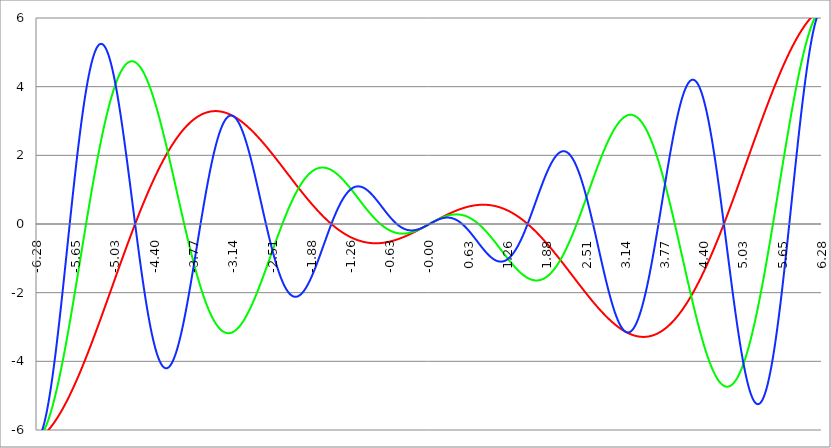
| Category | Series 1 | Series 0 | Series 2 |
|---|---|---|---|
| -6.283185307179586 | -6.283 | -6.283 | -6.283 |
| -6.276902121872407 | -6.277 | -6.276 | -6.276 |
| -6.270618936565228 | -6.27 | -6.269 | -6.266 |
| -6.264335751258049 | -6.263 | -6.26 | -6.254 |
| -6.25805256595087 | -6.256 | -6.25 | -6.24 |
| -6.25176938064369 | -6.249 | -6.239 | -6.224 |
| -6.245486195336511 | -6.241 | -6.228 | -6.206 |
| -6.23920301002933 | -6.233 | -6.215 | -6.185 |
| -6.232919824722153 | -6.225 | -6.201 | -6.162 |
| -6.226636639414973 | -6.217 | -6.187 | -6.137 |
| -6.220353454107794 | -6.208 | -6.171 | -6.11 |
| -6.214070268800615 | -6.199 | -6.155 | -6.081 |
| -6.207787083493435 | -6.19 | -6.137 | -6.05 |
| -6.201503898186257 | -6.181 | -6.119 | -6.016 |
| -6.195220712879077 | -6.171 | -6.1 | -5.981 |
| -6.188937527571898 | -6.161 | -6.079 | -5.943 |
| -6.182654342264719 | -6.151 | -6.058 | -5.904 |
| -6.17637115695754 | -6.141 | -6.036 | -5.862 |
| -6.170087971650361 | -6.131 | -6.013 | -5.818 |
| -6.163804786343182 | -6.12 | -5.989 | -5.773 |
| -6.157521601036002 | -6.109 | -5.964 | -5.725 |
| -6.151238415728823 | -6.098 | -5.938 | -5.676 |
| -6.144955230421644 | -6.086 | -5.912 | -5.624 |
| -6.138672045114464 | -6.075 | -5.884 | -5.571 |
| -6.132388859807286 | -6.063 | -5.856 | -5.516 |
| -6.126105674500106 | -6.051 | -5.826 | -5.458 |
| -6.119822489192927 | -6.038 | -5.796 | -5.399 |
| -6.113539303885748 | -6.026 | -5.765 | -5.339 |
| -6.107256118578569 | -6.013 | -5.733 | -5.276 |
| -6.10097293327139 | -6 | -5.7 | -5.212 |
| -6.09468974796421 | -5.987 | -5.667 | -5.146 |
| -6.088406562657031 | -5.973 | -5.632 | -5.078 |
| -6.082123377349852 | -5.96 | -5.597 | -5.009 |
| -6.075840192042672 | -5.946 | -5.561 | -4.938 |
| -6.069557006735494 | -5.932 | -5.524 | -4.865 |
| -6.063273821428314 | -5.917 | -5.486 | -4.791 |
| -6.056990636121135 | -5.903 | -5.448 | -4.715 |
| -6.050707450813956 | -5.888 | -5.408 | -4.638 |
| -6.044424265506777 | -5.873 | -5.368 | -4.559 |
| -6.038141080199597 | -5.858 | -5.327 | -4.479 |
| -6.031857894892418 | -5.842 | -5.286 | -4.397 |
| -6.025574709585239 | -5.827 | -5.243 | -4.314 |
| -6.01929152427806 | -5.811 | -5.2 | -4.229 |
| -6.013008338970881 | -5.795 | -5.156 | -4.144 |
| -6.006725153663701 | -5.779 | -5.112 | -4.057 |
| -6.000441968356522 | -5.762 | -5.066 | -3.968 |
| -5.994158783049343 | -5.746 | -5.02 | -3.879 |
| -5.987875597742164 | -5.729 | -4.974 | -3.788 |
| -5.981592412434984 | -5.712 | -4.926 | -3.696 |
| -5.975309227127805 | -5.694 | -4.878 | -3.603 |
| -5.969026041820626 | -5.677 | -4.829 | -3.509 |
| -5.962742856513447 | -5.659 | -4.78 | -3.413 |
| -5.956459671206268 | -5.641 | -4.729 | -3.317 |
| -5.950176485899088 | -5.623 | -4.679 | -3.22 |
| -5.94389330059191 | -5.605 | -4.627 | -3.122 |
| -5.93761011528473 | -5.587 | -4.575 | -3.022 |
| -5.931326929977551 | -5.568 | -4.522 | -2.923 |
| -5.925043744670372 | -5.549 | -4.469 | -2.822 |
| -5.918760559363193 | -5.53 | -4.415 | -2.72 |
| -5.912477374056014 | -5.511 | -4.361 | -2.618 |
| -5.906194188748834 | -5.491 | -4.305 | -2.515 |
| -5.899911003441655 | -5.472 | -4.25 | -2.411 |
| -5.893627818134476 | -5.452 | -4.194 | -2.307 |
| -5.887344632827297 | -5.432 | -4.137 | -2.202 |
| -5.881061447520117 | -5.412 | -4.079 | -2.096 |
| -5.874778262212938 | -5.392 | -4.022 | -1.99 |
| -5.868495076905759 | -5.371 | -3.963 | -1.883 |
| -5.86221189159858 | -5.35 | -3.904 | -1.776 |
| -5.855928706291401 | -5.33 | -3.845 | -1.669 |
| -5.849645520984221 | -5.308 | -3.785 | -1.561 |
| -5.843362335677042 | -5.287 | -3.725 | -1.453 |
| -5.837079150369863 | -5.266 | -3.664 | -1.345 |
| -5.830795965062684 | -5.244 | -3.603 | -1.236 |
| -5.824512779755505 | -5.222 | -3.541 | -1.127 |
| -5.818229594448325 | -5.201 | -3.479 | -1.018 |
| -5.811946409141146 | -5.178 | -3.416 | -0.909 |
| -5.805663223833967 | -5.156 | -3.353 | -0.8 |
| -5.799380038526788 | -5.134 | -3.29 | -0.691 |
| -5.793096853219609 | -5.111 | -3.226 | -0.581 |
| -5.78681366791243 | -5.088 | -3.162 | -0.472 |
| -5.780530482605251 | -5.066 | -3.097 | -0.363 |
| -5.774247297298071 | -5.042 | -3.032 | -0.254 |
| -5.767964111990892 | -5.019 | -2.967 | -0.145 |
| -5.761680926683713 | -4.996 | -2.902 | -0.036 |
| -5.755397741376534 | -4.972 | -2.836 | 0.072 |
| -5.749114556069355 | -4.949 | -2.77 | 0.181 |
| -5.742831370762175 | -4.925 | -2.703 | 0.289 |
| -5.736548185454996 | -4.901 | -2.636 | 0.396 |
| -5.730265000147816 | -4.876 | -2.569 | 0.503 |
| -5.723981814840638 | -4.852 | -2.502 | 0.61 |
| -5.717698629533459 | -4.828 | -2.434 | 0.717 |
| -5.711415444226279 | -4.803 | -2.367 | 0.823 |
| -5.7051322589191 | -4.778 | -2.299 | 0.928 |
| -5.698849073611921 | -4.753 | -2.23 | 1.033 |
| -5.692565888304742 | -4.728 | -2.162 | 1.137 |
| -5.686282702997562 | -4.703 | -2.093 | 1.24 |
| -5.679999517690383 | -4.678 | -2.024 | 1.343 |
| -5.673716332383204 | -4.652 | -1.955 | 1.445 |
| -5.667433147076025 | -4.627 | -1.886 | 1.547 |
| -5.661149961768846 | -4.601 | -1.817 | 1.648 |
| -5.654866776461667 | -4.575 | -1.747 | 1.747 |
| -5.648583591154487 | -4.549 | -1.678 | 1.846 |
| -5.642300405847308 | -4.523 | -1.608 | 1.945 |
| -5.63601722054013 | -4.496 | -1.538 | 2.042 |
| -5.62973403523295 | -4.47 | -1.468 | 2.138 |
| -5.623450849925771 | -4.443 | -1.398 | 2.233 |
| -5.617167664618591 | -4.417 | -1.328 | 2.328 |
| -5.610884479311412 | -4.39 | -1.258 | 2.421 |
| -5.604601294004233 | -4.363 | -1.188 | 2.513 |
| -5.598318108697054 | -4.336 | -1.118 | 2.604 |
| -5.592034923389875 | -4.309 | -1.048 | 2.694 |
| -5.585751738082695 | -4.281 | -0.978 | 2.783 |
| -5.579468552775516 | -4.254 | -0.907 | 2.87 |
| -5.573185367468337 | -4.226 | -0.837 | 2.957 |
| -5.566902182161157 | -4.199 | -0.767 | 3.042 |
| -5.560618996853979 | -4.171 | -0.697 | 3.126 |
| -5.5543358115468 | -4.143 | -0.627 | 3.208 |
| -5.54805262623962 | -4.115 | -0.557 | 3.289 |
| -5.54176944093244 | -4.087 | -0.487 | 3.369 |
| -5.535486255625262 | -4.059 | -0.417 | 3.447 |
| -5.529203070318083 | -4.031 | -0.347 | 3.524 |
| -5.522919885010904 | -4.002 | -0.277 | 3.6 |
| -5.516636699703724 | -3.974 | -0.208 | 3.674 |
| -5.510353514396545 | -3.945 | -0.138 | 3.747 |
| -5.504070329089366 | -3.916 | -0.069 | 3.818 |
| -5.497787143782186 | -3.888 | 0 | 3.888 |
| -5.491503958475008 | -3.859 | 0.069 | 3.956 |
| -5.485220773167828 | -3.83 | 0.138 | 4.022 |
| -5.47893758786065 | -3.8 | 0.207 | 4.087 |
| -5.47265440255347 | -3.771 | 0.275 | 4.15 |
| -5.466371217246291 | -3.742 | 0.343 | 4.212 |
| -5.460088031939112 | -3.713 | 0.411 | 4.272 |
| -5.453804846631932 | -3.683 | 0.479 | 4.33 |
| -5.447521661324753 | -3.654 | 0.547 | 4.387 |
| -5.441238476017574 | -3.624 | 0.614 | 4.442 |
| -5.434955290710395 | -3.594 | 0.681 | 4.495 |
| -5.428672105403215 | -3.564 | 0.748 | 4.547 |
| -5.422388920096036 | -3.534 | 0.815 | 4.596 |
| -5.416105734788857 | -3.505 | 0.881 | 4.644 |
| -5.409822549481678 | -3.474 | 0.947 | 4.691 |
| -5.403539364174499 | -3.444 | 1.013 | 4.735 |
| -5.39725617886732 | -3.414 | 1.078 | 4.778 |
| -5.39097299356014 | -3.384 | 1.143 | 4.819 |
| -5.384689808252961 | -3.354 | 1.208 | 4.858 |
| -5.378406622945782 | -3.323 | 1.272 | 4.895 |
| -5.372123437638603 | -3.293 | 1.336 | 4.93 |
| -5.365840252331424 | -3.262 | 1.4 | 4.964 |
| -5.359557067024244 | -3.231 | 1.463 | 4.995 |
| -5.353273881717065 | -3.201 | 1.526 | 5.025 |
| -5.346990696409886 | -3.17 | 1.588 | 5.053 |
| -5.340707511102707 | -3.139 | 1.65 | 5.079 |
| -5.334424325795528 | -3.108 | 1.712 | 5.104 |
| -5.328141140488348 | -3.077 | 1.773 | 5.126 |
| -5.32185795518117 | -3.046 | 1.834 | 5.146 |
| -5.31557476987399 | -3.015 | 1.895 | 5.165 |
| -5.30929158456681 | -2.984 | 1.954 | 5.181 |
| -5.303008399259631 | -2.953 | 2.014 | 5.196 |
| -5.296725213952453 | -2.922 | 2.073 | 5.209 |
| -5.290442028645273 | -2.891 | 2.132 | 5.22 |
| -5.284158843338094 | -2.859 | 2.19 | 5.229 |
| -5.277875658030915 | -2.828 | 2.247 | 5.236 |
| -5.271592472723735 | -2.797 | 2.304 | 5.242 |
| -5.265309287416557 | -2.765 | 2.361 | 5.245 |
| -5.259026102109377 | -2.734 | 2.417 | 5.246 |
| -5.252742916802198 | -2.702 | 2.472 | 5.246 |
| -5.246459731495019 | -2.671 | 2.528 | 5.244 |
| -5.24017654618784 | -2.639 | 2.582 | 5.24 |
| -5.23389336088066 | -2.607 | 2.636 | 5.234 |
| -5.227610175573481 | -2.576 | 2.689 | 5.226 |
| -5.221326990266302 | -2.544 | 2.742 | 5.216 |
| -5.215043804959122 | -2.512 | 2.794 | 5.205 |
| -5.208760619651944 | -2.481 | 2.846 | 5.191 |
| -5.202477434344764 | -2.449 | 2.897 | 5.176 |
| -5.196194249037585 | -2.417 | 2.948 | 5.159 |
| -5.189911063730406 | -2.385 | 2.998 | 5.14 |
| -5.183627878423227 | -2.353 | 3.047 | 5.12 |
| -5.177344693116048 | -2.321 | 3.096 | 5.097 |
| -5.171061507808868 | -2.29 | 3.144 | 5.073 |
| -5.164778322501689 | -2.258 | 3.191 | 5.047 |
| -5.15849513719451 | -2.226 | 3.238 | 5.02 |
| -5.152211951887331 | -2.194 | 3.284 | 4.99 |
| -5.145928766580152 | -2.162 | 3.33 | 4.959 |
| -5.139645581272972 | -2.13 | 3.375 | 4.926 |
| -5.133362395965793 | -2.098 | 3.419 | 4.892 |
| -5.127079210658614 | -2.066 | 3.462 | 4.856 |
| -5.120796025351435 | -2.034 | 3.505 | 4.818 |
| -5.114512840044256 | -2.002 | 3.548 | 4.779 |
| -5.108229654737076 | -1.97 | 3.589 | 4.738 |
| -5.101946469429897 | -1.938 | 3.63 | 4.695 |
| -5.095663284122718 | -1.906 | 3.67 | 4.651 |
| -5.08938009881554 | -1.874 | 3.71 | 4.605 |
| -5.08309691350836 | -1.841 | 3.749 | 4.558 |
| -5.07681372820118 | -1.809 | 3.787 | 4.509 |
| -5.070530542894002 | -1.777 | 3.824 | 4.459 |
| -5.064247357586822 | -1.745 | 3.861 | 4.407 |
| -5.057964172279643 | -1.713 | 3.897 | 4.354 |
| -5.051680986972464 | -1.681 | 3.933 | 4.299 |
| -5.045397801665285 | -1.649 | 3.967 | 4.243 |
| -5.039114616358106 | -1.617 | 4.001 | 4.185 |
| -5.032831431050926 | -1.585 | 4.034 | 4.127 |
| -5.026548245743747 | -1.553 | 4.067 | 4.067 |
| -5.020265060436568 | -1.521 | 4.098 | 4.005 |
| -5.013981875129389 | -1.489 | 4.129 | 3.942 |
| -5.00769868982221 | -1.457 | 4.159 | 3.878 |
| -5.00141550451503 | -1.425 | 4.189 | 3.813 |
| -4.995132319207851 | -1.394 | 4.218 | 3.747 |
| -4.98884913390067 | -1.362 | 4.245 | 3.679 |
| -4.982565948593493 | -1.33 | 4.273 | 3.611 |
| -4.976282763286313 | -1.298 | 4.299 | 3.541 |
| -4.969999577979134 | -1.266 | 4.325 | 3.47 |
| -4.963716392671955 | -1.234 | 4.35 | 3.398 |
| -4.957433207364776 | -1.203 | 4.374 | 3.325 |
| -4.951150022057597 | -1.171 | 4.397 | 3.251 |
| -4.944866836750418 | -1.139 | 4.42 | 3.176 |
| -4.938583651443238 | -1.108 | 4.442 | 3.1 |
| -4.932300466136059 | -1.076 | 4.463 | 3.023 |
| -4.92601728082888 | -1.044 | 4.483 | 2.945 |
| -4.9197340955217 | -1.013 | 4.503 | 2.867 |
| -4.913450910214521 | -0.981 | 4.522 | 2.787 |
| -4.907167724907342 | -0.95 | 4.54 | 2.707 |
| -4.900884539600163 | -0.918 | 4.557 | 2.626 |
| -4.894601354292984 | -0.887 | 4.573 | 2.544 |
| -4.888318168985805 | -0.856 | 4.589 | 2.462 |
| -4.882034983678625 | -0.824 | 4.604 | 2.379 |
| -4.875751798371446 | -0.793 | 4.618 | 2.295 |
| -4.869468613064267 | -0.762 | 4.631 | 2.211 |
| -4.863185427757088 | -0.731 | 4.644 | 2.126 |
| -4.856902242449909 | -0.699 | 4.655 | 2.04 |
| -4.85061905714273 | -0.668 | 4.666 | 1.954 |
| -4.84433587183555 | -0.637 | 4.677 | 1.868 |
| -4.838052686528371 | -0.606 | 4.686 | 1.781 |
| -4.831769501221192 | -0.575 | 4.695 | 1.694 |
| -4.825486315914013 | -0.545 | 4.703 | 1.606 |
| -4.819203130606833 | -0.514 | 4.71 | 1.518 |
| -4.812919945299654 | -0.483 | 4.716 | 1.43 |
| -4.806636759992475 | -0.452 | 4.721 | 1.341 |
| -4.800353574685296 | -0.422 | 4.726 | 1.252 |
| -4.794070389378117 | -0.391 | 4.73 | 1.163 |
| -4.787787204070938 | -0.361 | 4.733 | 1.074 |
| -4.781504018763758 | -0.33 | 4.736 | 0.984 |
| -4.77522083345658 | -0.3 | 4.738 | 0.895 |
| -4.7689376481494 | -0.27 | 4.738 | 0.805 |
| -4.762654462842221 | -0.239 | 4.739 | 0.715 |
| -4.756371277535042 | -0.209 | 4.738 | 0.626 |
| -4.750088092227862 | -0.179 | 4.737 | 0.536 |
| -4.743804906920683 | -0.149 | 4.734 | 0.446 |
| -4.737521721613504 | -0.119 | 4.732 | 0.357 |
| -4.731238536306324 | -0.089 | 4.728 | 0.267 |
| -4.724955350999146 | -0.059 | 4.723 | 0.178 |
| -4.718672165691966 | -0.03 | 4.718 | 0.089 |
| -4.712388980384787 | 0 | 4.712 | 0 |
| -4.706105795077608 | 0.03 | 4.706 | -0.089 |
| -4.699822609770429 | 0.059 | 4.698 | -0.177 |
| -4.69353942446325 | 0.088 | 4.69 | -0.265 |
| -4.68725623915607 | 0.118 | 4.681 | -0.353 |
| -4.680973053848891 | 0.147 | 4.672 | -0.441 |
| -4.674689868541712 | 0.176 | 4.661 | -0.528 |
| -4.668406683234533 | 0.205 | 4.65 | -0.614 |
| -4.662123497927354 | 0.234 | 4.639 | -0.7 |
| -4.655840312620174 | 0.263 | 4.626 | -0.786 |
| -4.649557127312995 | 0.292 | 4.613 | -0.871 |
| -4.643273942005816 | 0.321 | 4.599 | -0.956 |
| -4.636990756698637 | 0.349 | 4.584 | -1.04 |
| -4.630707571391458 | 0.378 | 4.569 | -1.123 |
| -4.624424386084279 | 0.406 | 4.553 | -1.206 |
| -4.618141200777099 | 0.435 | 4.536 | -1.288 |
| -4.61185801546992 | 0.463 | 4.519 | -1.37 |
| -4.605574830162741 | 0.491 | 4.501 | -1.451 |
| -4.599291644855561 | 0.519 | 4.482 | -1.531 |
| -4.593008459548383 | 0.547 | 4.463 | -1.61 |
| -4.586725274241203 | 0.575 | 4.443 | -1.688 |
| -4.580442088934024 | 0.603 | 4.422 | -1.766 |
| -4.574158903626845 | 0.63 | 4.4 | -1.843 |
| -4.567875718319666 | 0.658 | 4.378 | -1.919 |
| -4.561592533012487 | 0.685 | 4.356 | -1.994 |
| -4.555309347705307 | 0.713 | 4.332 | -2.068 |
| -4.549026162398128 | 0.74 | 4.308 | -2.141 |
| -4.542742977090949 | 0.767 | 4.284 | -2.213 |
| -4.53645979178377 | 0.794 | 4.259 | -2.285 |
| -4.530176606476591 | 0.821 | 4.233 | -2.355 |
| -4.523893421169412 | 0.848 | 4.206 | -2.424 |
| -4.517610235862232 | 0.874 | 4.179 | -2.492 |
| -4.511327050555053 | 0.901 | 4.151 | -2.559 |
| -4.505043865247874 | 0.927 | 4.123 | -2.625 |
| -4.498760679940694 | 0.954 | 4.094 | -2.69 |
| -4.492477494633515 | 0.98 | 4.065 | -2.753 |
| -4.486194309326336 | 1.006 | 4.035 | -2.816 |
| -4.479911124019157 | 1.032 | 4.004 | -2.877 |
| -4.473627938711977 | 1.058 | 3.973 | -2.937 |
| -4.467344753404799 | 1.084 | 3.941 | -2.996 |
| -4.46106156809762 | 1.109 | 3.909 | -3.054 |
| -4.45477838279044 | 1.135 | 3.876 | -3.11 |
| -4.44849519748326 | 1.16 | 3.843 | -3.165 |
| -4.442212012176082 | 1.186 | 3.809 | -3.219 |
| -4.435928826868903 | 1.211 | 3.775 | -3.272 |
| -4.429645641561723 | 1.236 | 3.74 | -3.323 |
| -4.423362456254544 | 1.261 | 3.705 | -3.373 |
| -4.417079270947365 | 1.286 | 3.669 | -3.421 |
| -4.410796085640185 | 1.31 | 3.632 | -3.468 |
| -4.404512900333007 | 1.335 | 3.596 | -3.514 |
| -4.398229715025827 | 1.359 | 3.558 | -3.558 |
| -4.391946529718648 | 1.383 | 3.52 | -3.601 |
| -4.38566334441147 | 1.408 | 3.482 | -3.643 |
| -4.37938015910429 | 1.432 | 3.443 | -3.683 |
| -4.373096973797111 | 1.455 | 3.404 | -3.721 |
| -4.366813788489932 | 1.479 | 3.365 | -3.759 |
| -4.360530603182752 | 1.503 | 3.325 | -3.794 |
| -4.354247417875573 | 1.526 | 3.284 | -3.829 |
| -4.347964232568394 | 1.55 | 3.243 | -3.862 |
| -4.341681047261215 | 1.573 | 3.202 | -3.893 |
| -4.335397861954035 | 1.596 | 3.16 | -3.923 |
| -4.329114676646856 | 1.619 | 3.118 | -3.951 |
| -4.322831491339677 | 1.642 | 3.076 | -3.978 |
| -4.316548306032498 | 1.664 | 3.033 | -4.003 |
| -4.310265120725319 | 1.687 | 2.99 | -4.027 |
| -4.30398193541814 | 1.709 | 2.946 | -4.05 |
| -4.29769875011096 | 1.732 | 2.902 | -4.07 |
| -4.291415564803781 | 1.754 | 2.858 | -4.09 |
| -4.285132379496602 | 1.776 | 2.814 | -4.107 |
| -4.278849194189422 | 1.797 | 2.769 | -4.124 |
| -4.272566008882244 | 1.819 | 2.723 | -4.138 |
| -4.266282823575064 | 1.841 | 2.678 | -4.152 |
| -4.259999638267885 | 1.862 | 2.632 | -4.163 |
| -4.253716452960706 | 1.883 | 2.586 | -4.173 |
| -4.247433267653527 | 1.904 | 2.54 | -4.182 |
| -4.241150082346347 | 1.925 | 2.493 | -4.189 |
| -4.234866897039168 | 1.946 | 2.446 | -4.194 |
| -4.228583711731989 | 1.967 | 2.399 | -4.198 |
| -4.22230052642481 | 1.987 | 2.351 | -4.201 |
| -4.216017341117631 | 2.008 | 2.304 | -4.202 |
| -4.209734155810452 | 2.028 | 2.256 | -4.201 |
| -4.203450970503273 | 2.048 | 2.208 | -4.199 |
| -4.197167785196093 | 2.068 | 2.159 | -4.196 |
| -4.190884599888914 | 2.088 | 2.111 | -4.191 |
| -4.184601414581734 | 2.107 | 2.062 | -4.184 |
| -4.178318229274556 | 2.127 | 2.013 | -4.176 |
| -4.172035043967377 | 2.146 | 1.964 | -4.167 |
| -4.165751858660197 | 2.165 | 1.914 | -4.156 |
| -4.159468673353018 | 2.184 | 1.865 | -4.143 |
| -4.153185488045839 | 2.203 | 1.815 | -4.13 |
| -4.14690230273866 | 2.222 | 1.766 | -4.114 |
| -4.140619117431481 | 2.241 | 1.716 | -4.097 |
| -4.134335932124301 | 2.259 | 1.666 | -4.079 |
| -4.128052746817122 | 2.277 | 1.616 | -4.06 |
| -4.121769561509943 | 2.295 | 1.565 | -4.039 |
| -4.115486376202764 | 2.313 | 1.515 | -4.016 |
| -4.109203190895584 | 2.331 | 1.465 | -3.993 |
| -4.102920005588405 | 2.349 | 1.414 | -3.968 |
| -4.096636820281226 | 2.366 | 1.363 | -3.941 |
| -4.090353634974047 | 2.383 | 1.313 | -3.913 |
| -4.084070449666868 | 2.401 | 1.262 | -3.884 |
| -4.077787264359689 | 2.418 | 1.211 | -3.854 |
| -4.071504079052509 | 2.434 | 1.16 | -3.822 |
| -4.06522089374533 | 2.451 | 1.11 | -3.789 |
| -4.058937708438151 | 2.468 | 1.059 | -3.755 |
| -4.052654523130972 | 2.484 | 1.008 | -3.719 |
| -4.046371337823793 | 2.5 | 0.957 | -3.683 |
| -4.040088152516613 | 2.516 | 0.906 | -3.645 |
| -4.033804967209434 | 2.532 | 0.855 | -3.606 |
| -4.027521781902255 | 2.548 | 0.804 | -3.565 |
| -4.021238596595076 | 2.563 | 0.754 | -3.524 |
| -4.014955411287897 | 2.579 | 0.703 | -3.481 |
| -4.008672225980717 | 2.594 | 0.652 | -3.438 |
| -4.002389040673538 | 2.609 | 0.601 | -3.393 |
| -3.996105855366359 | 2.624 | 0.551 | -3.347 |
| -3.989822670059179 | 2.639 | 0.5 | -3.3 |
| -3.983539484752 | 2.653 | 0.45 | -3.252 |
| -3.97725629944482 | 2.667 | 0.399 | -3.203 |
| -3.97097311413764 | 2.682 | 0.349 | -3.153 |
| -3.96468992883046 | 2.696 | 0.299 | -3.102 |
| -3.958406743523281 | 2.71 | 0.249 | -3.05 |
| -3.952123558216101 | 2.723 | 0.199 | -2.997 |
| -3.945840372908922 | 2.737 | 0.149 | -2.943 |
| -3.939557187601742 | 2.75 | 0.099 | -2.889 |
| -3.933274002294562 | 2.764 | 0.049 | -2.833 |
| -3.926990816987382 | 2.777 | 0 | -2.777 |
| -3.920707631680203 | 2.79 | -0.049 | -2.72 |
| -3.914424446373023 | 2.802 | -0.098 | -2.662 |
| -3.908141261065844 | 2.815 | -0.147 | -2.603 |
| -3.901858075758664 | 2.827 | -0.196 | -2.543 |
| -3.895574890451484 | 2.84 | -0.245 | -2.483 |
| -3.889291705144305 | 2.852 | -0.293 | -2.422 |
| -3.883008519837125 | 2.864 | -0.341 | -2.361 |
| -3.876725334529945 | 2.876 | -0.389 | -2.298 |
| -3.870442149222766 | 2.887 | -0.437 | -2.235 |
| -3.864158963915586 | 2.899 | -0.484 | -2.172 |
| -3.857875778608407 | 2.91 | -0.532 | -2.108 |
| -3.851592593301227 | 2.921 | -0.579 | -2.043 |
| -3.845309407994047 | 2.932 | -0.625 | -1.978 |
| -3.839026222686868 | 2.943 | -0.672 | -1.913 |
| -3.832743037379688 | 2.953 | -0.718 | -1.846 |
| -3.826459852072508 | 2.964 | -0.764 | -1.78 |
| -3.820176666765329 | 2.974 | -0.81 | -1.713 |
| -3.813893481458149 | 2.984 | -0.855 | -1.646 |
| -3.807610296150969 | 2.994 | -0.9 | -1.578 |
| -3.80132711084379 | 3.004 | -0.945 | -1.51 |
| -3.79504392553661 | 3.013 | -0.99 | -1.441 |
| -3.78876074022943 | 3.023 | -1.034 | -1.373 |
| -3.782477554922251 | 3.032 | -1.078 | -1.304 |
| -3.776194369615071 | 3.041 | -1.122 | -1.234 |
| -3.769911184307892 | 3.05 | -1.165 | -1.165 |
| -3.763627999000712 | 3.059 | -1.208 | -1.095 |
| -3.757344813693532 | 3.067 | -1.251 | -1.026 |
| -3.751061628386352 | 3.076 | -1.293 | -0.956 |
| -3.744778443079173 | 3.084 | -1.335 | -0.886 |
| -3.738495257771993 | 3.092 | -1.376 | -0.816 |
| -3.732212072464814 | 3.1 | -1.417 | -0.745 |
| -3.725928887157634 | 3.108 | -1.458 | -0.675 |
| -3.719645701850454 | 3.115 | -1.499 | -0.605 |
| -3.713362516543275 | 3.123 | -1.539 | -0.535 |
| -3.707079331236095 | 3.13 | -1.578 | -0.465 |
| -3.700796145928915 | 3.137 | -1.618 | -0.395 |
| -3.694512960621736 | 3.144 | -1.657 | -0.325 |
| -3.688229775314556 | 3.151 | -1.695 | -0.255 |
| -3.681946590007376 | 3.157 | -1.733 | -0.185 |
| -3.675663404700197 | 3.164 | -1.771 | -0.115 |
| -3.669380219393017 | 3.17 | -1.808 | -0.046 |
| -3.663097034085838 | 3.176 | -1.845 | 0.023 |
| -3.656813848778658 | 3.182 | -1.881 | 0.092 |
| -3.650530663471478 | 3.188 | -1.917 | 0.161 |
| -3.644247478164299 | 3.193 | -1.953 | 0.229 |
| -3.63796429285712 | 3.199 | -1.988 | 0.297 |
| -3.631681107549939 | 3.204 | -2.022 | 0.364 |
| -3.62539792224276 | 3.209 | -2.057 | 0.432 |
| -3.61911473693558 | 3.214 | -2.09 | 0.499 |
| -3.612831551628401 | 3.219 | -2.124 | 0.565 |
| -3.606548366321221 | 3.224 | -2.156 | 0.631 |
| -3.600265181014041 | 3.228 | -2.189 | 0.697 |
| -3.593981995706862 | 3.232 | -2.221 | 0.762 |
| -3.587698810399682 | 3.237 | -2.252 | 0.827 |
| -3.581415625092502 | 3.241 | -2.283 | 0.891 |
| -3.575132439785323 | 3.244 | -2.313 | 0.954 |
| -3.568849254478143 | 3.248 | -2.343 | 1.017 |
| -3.562566069170964 | 3.252 | -2.373 | 1.08 |
| -3.556282883863784 | 3.255 | -2.402 | 1.141 |
| -3.549999698556604 | 3.258 | -2.43 | 1.203 |
| -3.543716513249425 | 3.261 | -2.458 | 1.263 |
| -3.537433327942245 | 3.264 | -2.486 | 1.323 |
| -3.531150142635065 | 3.267 | -2.513 | 1.382 |
| -3.524866957327886 | 3.269 | -2.539 | 1.44 |
| -3.518583772020706 | 3.271 | -2.565 | 1.498 |
| -3.512300586713526 | 3.274 | -2.59 | 1.555 |
| -3.506017401406347 | 3.276 | -2.615 | 1.611 |
| -3.499734216099167 | 3.278 | -2.64 | 1.667 |
| -3.493451030791987 | 3.279 | -2.664 | 1.721 |
| -3.487167845484808 | 3.281 | -2.687 | 1.775 |
| -3.480884660177628 | 3.282 | -2.71 | 1.828 |
| -3.474601474870449 | 3.284 | -2.732 | 1.88 |
| -3.468318289563269 | 3.285 | -2.754 | 1.931 |
| -3.462035104256089 | 3.286 | -2.775 | 1.982 |
| -3.45575191894891 | 3.287 | -2.796 | 2.031 |
| -3.44946873364173 | 3.287 | -2.816 | 2.08 |
| -3.44318554833455 | 3.288 | -2.836 | 2.127 |
| -3.436902363027371 | 3.288 | -2.855 | 2.174 |
| -3.430619177720191 | 3.288 | -2.873 | 2.22 |
| -3.424335992413011 | 3.288 | -2.891 | 2.265 |
| -3.418052807105832 | 3.288 | -2.909 | 2.308 |
| -3.411769621798652 | 3.288 | -2.926 | 2.351 |
| -3.405486436491473 | 3.288 | -2.942 | 2.393 |
| -3.399203251184293 | 3.287 | -2.958 | 2.434 |
| -3.392920065877113 | 3.286 | -2.973 | 2.473 |
| -3.386636880569934 | 3.285 | -2.988 | 2.512 |
| -3.380353695262754 | 3.284 | -3.002 | 2.55 |
| -3.374070509955574 | 3.283 | -3.016 | 2.586 |
| -3.367787324648395 | 3.282 | -3.029 | 2.622 |
| -3.361504139341215 | 3.281 | -3.042 | 2.656 |
| -3.355220954034035 | 3.279 | -3.054 | 2.689 |
| -3.348937768726855 | 3.277 | -3.065 | 2.722 |
| -3.342654583419676 | 3.275 | -3.076 | 2.753 |
| -3.336371398112496 | 3.273 | -3.086 | 2.783 |
| -3.330088212805317 | 3.271 | -3.096 | 2.812 |
| -3.323805027498137 | 3.269 | -3.106 | 2.839 |
| -3.317521842190957 | 3.266 | -3.114 | 2.866 |
| -3.311238656883778 | 3.264 | -3.122 | 2.892 |
| -3.304955471576598 | 3.261 | -3.13 | 2.916 |
| -3.298672286269419 | 3.258 | -3.137 | 2.939 |
| -3.292389100962239 | 3.255 | -3.144 | 2.961 |
| -3.286105915655059 | 3.252 | -3.15 | 2.982 |
| -3.27982273034788 | 3.249 | -3.155 | 3.002 |
| -3.2735395450407 | 3.245 | -3.16 | 3.02 |
| -3.26725635973352 | 3.241 | -3.165 | 3.038 |
| -3.260973174426341 | 3.238 | -3.168 | 3.054 |
| -3.254689989119161 | 3.234 | -3.172 | 3.069 |
| -3.248406803811982 | 3.23 | -3.175 | 3.083 |
| -3.242123618504802 | 3.226 | -3.177 | 3.096 |
| -3.235840433197622 | 3.221 | -3.179 | 3.107 |
| -3.229557247890442 | 3.217 | -3.18 | 3.118 |
| -3.223274062583263 | 3.213 | -3.18 | 3.127 |
| -3.216990877276083 | 3.208 | -3.18 | 3.135 |
| -3.210707691968904 | 3.203 | -3.18 | 3.142 |
| -3.204424506661724 | 3.198 | -3.179 | 3.148 |
| -3.198141321354544 | 3.193 | -3.178 | 3.152 |
| -3.191858136047365 | 3.188 | -3.176 | 3.156 |
| -3.185574950740185 | 3.182 | -3.173 | 3.158 |
| -3.179291765433005 | 3.177 | -3.17 | 3.159 |
| -3.173008580125826 | 3.171 | -3.167 | 3.159 |
| -3.166725394818646 | 3.166 | -3.163 | 3.158 |
| -3.160442209511467 | 3.16 | -3.158 | 3.155 |
| -3.154159024204287 | 3.154 | -3.153 | 3.152 |
| -3.147875838897107 | 3.148 | -3.148 | 3.147 |
| -3.141592653589928 | 3.142 | -3.142 | 3.142 |
| -3.135309468282748 | 3.135 | -3.135 | 3.135 |
| -3.129026282975568 | 3.129 | -3.128 | 3.127 |
| -3.122743097668389 | 3.122 | -3.121 | 3.118 |
| -3.116459912361209 | 3.115 | -3.113 | 3.108 |
| -3.110176727054029 | 3.109 | -3.104 | 3.096 |
| -3.10389354174685 | 3.102 | -3.095 | 3.084 |
| -3.09761035643967 | 3.095 | -3.086 | 3.071 |
| -3.09132717113249 | 3.087 | -3.076 | 3.056 |
| -3.085043985825311 | 3.08 | -3.065 | 3.041 |
| -3.078760800518131 | 3.073 | -3.054 | 3.024 |
| -3.072477615210952 | 3.065 | -3.043 | 3.007 |
| -3.066194429903772 | 3.057 | -3.031 | 2.988 |
| -3.059911244596592 | 3.05 | -3.019 | 2.969 |
| -3.053628059289413 | 3.042 | -3.006 | 2.948 |
| -3.047344873982233 | 3.034 | -2.993 | 2.926 |
| -3.041061688675053 | 3.026 | -2.98 | 2.904 |
| -3.034778503367874 | 3.017 | -2.966 | 2.88 |
| -3.028495318060694 | 3.009 | -2.951 | 2.856 |
| -3.022212132753515 | 3.001 | -2.936 | 2.83 |
| -3.015928947446335 | 2.992 | -2.921 | 2.804 |
| -3.009645762139155 | 2.983 | -2.905 | 2.777 |
| -3.003362576831975 | 2.975 | -2.889 | 2.749 |
| -2.997079391524796 | 2.966 | -2.873 | 2.72 |
| -2.990796206217616 | 2.957 | -2.856 | 2.69 |
| -2.984513020910436 | 2.948 | -2.838 | 2.659 |
| -2.978229835603257 | 2.939 | -2.821 | 2.628 |
| -2.971946650296077 | 2.929 | -2.803 | 2.595 |
| -2.965663464988898 | 2.92 | -2.784 | 2.562 |
| -2.959380279681718 | 2.91 | -2.765 | 2.528 |
| -2.953097094374538 | 2.901 | -2.746 | 2.493 |
| -2.946813909067359 | 2.891 | -2.726 | 2.458 |
| -2.94053072376018 | 2.881 | -2.706 | 2.422 |
| -2.934247538453 | 2.871 | -2.686 | 2.385 |
| -2.92796435314582 | 2.861 | -2.665 | 2.347 |
| -2.92168116783864 | 2.851 | -2.644 | 2.309 |
| -2.915397982531461 | 2.841 | -2.622 | 2.27 |
| -2.909114797224281 | 2.831 | -2.6 | 2.23 |
| -2.902831611917101 | 2.82 | -2.578 | 2.189 |
| -2.896548426609922 | 2.81 | -2.556 | 2.148 |
| -2.890265241302742 | 2.799 | -2.533 | 2.107 |
| -2.883982055995562 | 2.789 | -2.51 | 2.065 |
| -2.877698870688383 | 2.778 | -2.486 | 2.022 |
| -2.871415685381203 | 2.767 | -2.462 | 1.979 |
| -2.865132500074023 | 2.756 | -2.438 | 1.935 |
| -2.858849314766844 | 2.745 | -2.414 | 1.891 |
| -2.852566129459664 | 2.734 | -2.389 | 1.846 |
| -2.846282944152485 | 2.723 | -2.364 | 1.8 |
| -2.839999758845305 | 2.712 | -2.339 | 1.755 |
| -2.833716573538125 | 2.7 | -2.313 | 1.709 |
| -2.827433388230946 | 2.689 | -2.287 | 1.662 |
| -2.821150202923766 | 2.678 | -2.261 | 1.615 |
| -2.814867017616586 | 2.666 | -2.235 | 1.568 |
| -2.808583832309407 | 2.654 | -2.208 | 1.52 |
| -2.802300647002227 | 2.643 | -2.181 | 1.472 |
| -2.796017461695047 | 2.631 | -2.154 | 1.423 |
| -2.789734276387867 | 2.619 | -2.127 | 1.375 |
| -2.783451091080688 | 2.607 | -2.099 | 1.326 |
| -2.777167905773509 | 2.595 | -2.072 | 1.276 |
| -2.770884720466329 | 2.583 | -2.044 | 1.227 |
| -2.764601535159149 | 2.57 | -2.015 | 1.177 |
| -2.75831834985197 | 2.558 | -1.987 | 1.127 |
| -2.75203516454479 | 2.546 | -1.958 | 1.077 |
| -2.74575197923761 | 2.533 | -1.929 | 1.027 |
| -2.739468793930431 | 2.521 | -1.9 | 0.976 |
| -2.733185608623251 | 2.508 | -1.871 | 0.926 |
| -2.726902423316071 | 2.496 | -1.842 | 0.875 |
| -2.720619238008892 | 2.483 | -1.812 | 0.824 |
| -2.714336052701712 | 2.47 | -1.782 | 0.774 |
| -2.708052867394532 | 2.458 | -1.752 | 0.723 |
| -2.701769682087352 | 2.445 | -1.722 | 0.672 |
| -2.695486496780173 | 2.432 | -1.692 | 0.621 |
| -2.689203311472993 | 2.419 | -1.662 | 0.57 |
| -2.682920126165814 | 2.406 | -1.631 | 0.519 |
| -2.676636940858634 | 2.392 | -1.6 | 0.468 |
| -2.670353755551454 | 2.379 | -1.57 | 0.418 |
| -2.664070570244275 | 2.366 | -1.539 | 0.367 |
| -2.657787384937095 | 2.353 | -1.508 | 0.317 |
| -2.651504199629916 | 2.339 | -1.477 | 0.266 |
| -2.645221014322736 | 2.326 | -1.445 | 0.216 |
| -2.638937829015556 | 2.313 | -1.414 | 0.166 |
| -2.632654643708377 | 2.299 | -1.383 | 0.116 |
| -2.626371458401197 | 2.285 | -1.351 | 0.066 |
| -2.620088273094018 | 2.272 | -1.32 | 0.016 |
| -2.613805087786838 | 2.258 | -1.288 | -0.033 |
| -2.607521902479658 | 2.244 | -1.256 | -0.082 |
| -2.601238717172478 | 2.231 | -1.224 | -0.131 |
| -2.594955531865299 | 2.217 | -1.193 | -0.179 |
| -2.588672346558119 | 2.203 | -1.161 | -0.227 |
| -2.58238916125094 | 2.189 | -1.129 | -0.275 |
| -2.57610597594376 | 2.175 | -1.097 | -0.323 |
| -2.56982279063658 | 2.161 | -1.065 | -0.37 |
| -2.563539605329401 | 2.147 | -1.033 | -0.417 |
| -2.557256420022221 | 2.133 | -1.001 | -0.463 |
| -2.550973234715042 | 2.119 | -0.969 | -0.509 |
| -2.544690049407862 | 2.105 | -0.937 | -0.555 |
| -2.538406864100682 | 2.09 | -0.905 | -0.6 |
| -2.532123678793503 | 2.076 | -0.873 | -0.645 |
| -2.525840493486323 | 2.062 | -0.841 | -0.689 |
| -2.519557308179143 | 2.048 | -0.809 | -0.733 |
| -2.513274122871964 | 2.033 | -0.777 | -0.777 |
| -2.506990937564784 | 2.019 | -0.745 | -0.82 |
| -2.500707752257604 | 2.004 | -0.713 | -0.862 |
| -2.494424566950425 | 1.99 | -0.681 | -0.904 |
| -2.488141381643245 | 1.976 | -0.649 | -0.945 |
| -2.481858196336065 | 1.961 | -0.617 | -0.986 |
| -2.475575011028886 | 1.947 | -0.585 | -1.026 |
| -2.469291825721706 | 1.932 | -0.554 | -1.065 |
| -2.463008640414527 | 1.917 | -0.522 | -1.104 |
| -2.456725455107347 | 1.903 | -0.491 | -1.143 |
| -2.450442269800167 | 1.888 | -0.459 | -1.181 |
| -2.444159084492988 | 1.873 | -0.428 | -1.218 |
| -2.437875899185808 | 1.859 | -0.396 | -1.254 |
| -2.431592713878628 | 1.844 | -0.365 | -1.29 |
| -2.425309528571449 | 1.829 | -0.334 | -1.325 |
| -2.419026343264269 | 1.815 | -0.303 | -1.36 |
| -2.412743157957089 | 1.8 | -0.272 | -1.394 |
| -2.40645997264991 | 1.785 | -0.242 | -1.427 |
| -2.40017678734273 | 1.77 | -0.211 | -1.459 |
| -2.393893602035551 | 1.755 | -0.18 | -1.491 |
| -2.387610416728371 | 1.74 | -0.15 | -1.522 |
| -2.381327231421191 | 1.726 | -0.12 | -1.552 |
| -2.375044046114012 | 1.711 | -0.09 | -1.582 |
| -2.368760860806832 | 1.696 | -0.06 | -1.611 |
| -2.362477675499652 | 1.681 | -0.03 | -1.639 |
| -2.356194490192473 | 1.666 | 0 | -1.666 |
| -2.349911304885293 | 1.651 | 0.03 | -1.693 |
| -2.343628119578113 | 1.636 | 0.059 | -1.718 |
| -2.337344934270934 | 1.621 | 0.088 | -1.744 |
| -2.331061748963754 | 1.606 | 0.117 | -1.768 |
| -2.324778563656574 | 1.591 | 0.146 | -1.791 |
| -2.318495378349395 | 1.576 | 0.175 | -1.814 |
| -2.312212193042215 | 1.562 | 0.203 | -1.836 |
| -2.305929007735036 | 1.547 | 0.231 | -1.857 |
| -2.299645822427856 | 1.532 | 0.26 | -1.877 |
| -2.293362637120676 | 1.517 | 0.287 | -1.897 |
| -2.287079451813496 | 1.502 | 0.315 | -1.915 |
| -2.280796266506317 | 1.487 | 0.343 | -1.933 |
| -2.274513081199137 | 1.472 | 0.37 | -1.95 |
| -2.268229895891957 | 1.457 | 0.397 | -1.967 |
| -2.261946710584778 | 1.442 | 0.424 | -1.982 |
| -2.255663525277598 | 1.427 | 0.45 | -1.997 |
| -2.249380339970419 | 1.412 | 0.477 | -2.011 |
| -2.24309715466324 | 1.397 | 0.503 | -2.024 |
| -2.23681396935606 | 1.382 | 0.529 | -2.036 |
| -2.23053078404888 | 1.367 | 0.555 | -2.047 |
| -2.2242475987417 | 1.352 | 0.58 | -2.058 |
| -2.217964413434521 | 1.337 | 0.605 | -2.067 |
| -2.211681228127341 | 1.322 | 0.63 | -2.076 |
| -2.205398042820161 | 1.307 | 0.655 | -2.084 |
| -2.199114857512981 | 1.293 | 0.68 | -2.091 |
| -2.192831672205802 | 1.278 | 0.704 | -2.098 |
| -2.186548486898622 | 1.263 | 0.728 | -2.104 |
| -2.180265301591443 | 1.248 | 0.751 | -2.108 |
| -2.173982116284263 | 1.233 | 0.775 | -2.112 |
| -2.167698930977084 | 1.218 | 0.798 | -2.115 |
| -2.161415745669904 | 1.204 | 0.821 | -2.118 |
| -2.155132560362724 | 1.189 | 0.843 | -2.119 |
| -2.148849375055545 | 1.174 | 0.866 | -2.12 |
| -2.142566189748365 | 1.159 | 0.888 | -2.12 |
| -2.136283004441185 | 1.145 | 0.91 | -2.119 |
| -2.129999819134006 | 1.13 | 0.931 | -2.118 |
| -2.123716633826826 | 1.115 | 0.952 | -2.116 |
| -2.117433448519646 | 1.101 | 0.973 | -2.112 |
| -2.111150263212467 | 1.086 | 0.994 | -2.108 |
| -2.104867077905287 | 1.071 | 1.014 | -2.104 |
| -2.098583892598107 | 1.057 | 1.034 | -2.098 |
| -2.092300707290928 | 1.042 | 1.054 | -2.092 |
| -2.086017521983748 | 1.028 | 1.073 | -2.085 |
| -2.079734336676569 | 1.013 | 1.092 | -2.078 |
| -2.073451151369389 | 0.999 | 1.111 | -2.069 |
| -2.06716796606221 | 0.984 | 1.129 | -2.06 |
| -2.06088478075503 | 0.97 | 1.148 | -2.05 |
| -2.05460159544785 | 0.956 | 1.166 | -2.04 |
| -2.04831841014067 | 0.941 | 1.183 | -2.029 |
| -2.042035224833491 | 0.927 | 1.2 | -2.017 |
| -2.035752039526311 | 0.913 | 1.217 | -2.004 |
| -2.029468854219131 | 0.899 | 1.234 | -1.991 |
| -2.023185668911951 | 0.884 | 1.25 | -1.977 |
| -2.016902483604772 | 0.87 | 1.266 | -1.963 |
| -2.010619298297592 | 0.856 | 1.282 | -1.947 |
| -2.004336112990412 | 0.842 | 1.297 | -1.932 |
| -1.998052927683233 | 0.828 | 1.312 | -1.915 |
| -1.991769742376054 | 0.814 | 1.327 | -1.898 |
| -1.985486557068874 | 0.8 | 1.341 | -1.88 |
| -1.979203371761694 | 0.786 | 1.355 | -1.862 |
| -1.972920186454515 | 0.772 | 1.369 | -1.843 |
| -1.966637001147335 | 0.758 | 1.382 | -1.824 |
| -1.960353815840155 | 0.745 | 1.395 | -1.804 |
| -1.954070630532976 | 0.731 | 1.408 | -1.783 |
| -1.947787445225796 | 0.717 | 1.42 | -1.762 |
| -1.941504259918616 | 0.703 | 1.432 | -1.741 |
| -1.935221074611437 | 0.69 | 1.444 | -1.719 |
| -1.928937889304257 | 0.676 | 1.455 | -1.696 |
| -1.922654703997078 | 0.663 | 1.466 | -1.673 |
| -1.916371518689898 | 0.649 | 1.477 | -1.65 |
| -1.910088333382718 | 0.636 | 1.487 | -1.625 |
| -1.903805148075539 | 0.622 | 1.497 | -1.601 |
| -1.897521962768359 | 0.609 | 1.507 | -1.576 |
| -1.891238777461179 | 0.596 | 1.516 | -1.551 |
| -1.884955592154 | 0.582 | 1.525 | -1.525 |
| -1.87867240684682 | 0.569 | 1.534 | -1.499 |
| -1.87238922153964 | 0.556 | 1.542 | -1.472 |
| -1.866106036232461 | 0.543 | 1.55 | -1.445 |
| -1.859822850925281 | 0.53 | 1.558 | -1.418 |
| -1.853539665618102 | 0.517 | 1.565 | -1.39 |
| -1.847256480310922 | 0.504 | 1.572 | -1.362 |
| -1.840973295003742 | 0.491 | 1.579 | -1.334 |
| -1.834690109696563 | 0.479 | 1.585 | -1.305 |
| -1.828406924389383 | 0.466 | 1.591 | -1.277 |
| -1.822123739082203 | 0.453 | 1.597 | -1.247 |
| -1.815840553775024 | 0.441 | 1.602 | -1.218 |
| -1.809557368467844 | 0.428 | 1.607 | -1.188 |
| -1.803274183160664 | 0.415 | 1.612 | -1.158 |
| -1.796990997853485 | 0.403 | 1.616 | -1.128 |
| -1.790707812546305 | 0.391 | 1.62 | -1.098 |
| -1.784424627239125 | 0.378 | 1.624 | -1.067 |
| -1.778141441931946 | 0.366 | 1.627 | -1.036 |
| -1.771858256624766 | 0.354 | 1.631 | -1.005 |
| -1.765575071317587 | 0.342 | 1.633 | -0.974 |
| -1.759291886010407 | 0.33 | 1.636 | -0.943 |
| -1.753008700703227 | 0.318 | 1.638 | -0.911 |
| -1.746725515396048 | 0.306 | 1.64 | -0.88 |
| -1.740442330088868 | 0.294 | 1.641 | -0.848 |
| -1.734159144781688 | 0.282 | 1.642 | -0.816 |
| -1.727875959474509 | 0.27 | 1.643 | -0.784 |
| -1.72159277416733 | 0.259 | 1.644 | -0.753 |
| -1.715309588860149 | 0.247 | 1.644 | -0.721 |
| -1.70902640355297 | 0.235 | 1.644 | -0.689 |
| -1.70274321824579 | 0.224 | 1.644 | -0.657 |
| -1.69646003293861 | 0.213 | 1.643 | -0.625 |
| -1.690176847631431 | 0.201 | 1.642 | -0.592 |
| -1.683893662324251 | 0.19 | 1.641 | -0.56 |
| -1.677610477017072 | 0.179 | 1.639 | -0.528 |
| -1.671327291709892 | 0.168 | 1.638 | -0.496 |
| -1.665044106402712 | 0.157 | 1.636 | -0.465 |
| -1.658760921095533 | 0.146 | 1.633 | -0.433 |
| -1.652477735788353 | 0.135 | 1.63 | -0.401 |
| -1.646194550481173 | 0.124 | 1.628 | -0.369 |
| -1.639911365173994 | 0.113 | 1.624 | -0.338 |
| -1.633628179866814 | 0.103 | 1.621 | -0.306 |
| -1.627344994559634 | 0.092 | 1.617 | -0.275 |
| -1.621061809252455 | 0.081 | 1.613 | -0.244 |
| -1.614778623945275 | 0.071 | 1.609 | -0.212 |
| -1.608495438638096 | 0.061 | 1.604 | -0.182 |
| -1.602212253330916 | 0.05 | 1.599 | -0.151 |
| -1.595929068023736 | 0.04 | 1.594 | -0.12 |
| -1.589645882716557 | 0.03 | 1.589 | -0.09 |
| -1.583362697409377 | 0.02 | 1.583 | -0.06 |
| -1.577079512102197 | 0.01 | 1.577 | -0.03 |
| -1.570796326795018 | 0 | 1.571 | 0 |
| -1.564513141487838 | -0.01 | 1.564 | 0.029 |
| -1.558229956180659 | -0.02 | 1.558 | 0.059 |
| -1.551946770873479 | -0.029 | 1.551 | 0.088 |
| -1.545663585566299 | -0.039 | 1.544 | 0.116 |
| -1.53938040025912 | -0.048 | 1.536 | 0.145 |
| -1.53309721495194 | -0.058 | 1.529 | 0.173 |
| -1.52681402964476 | -0.067 | 1.521 | 0.201 |
| -1.520530844337581 | -0.076 | 1.513 | 0.228 |
| -1.514247659030401 | -0.086 | 1.505 | 0.256 |
| -1.507964473723221 | -0.095 | 1.496 | 0.283 |
| -1.501681288416042 | -0.104 | 1.487 | 0.309 |
| -1.495398103108862 | -0.113 | 1.478 | 0.335 |
| -1.489114917801682 | -0.121 | 1.469 | 0.361 |
| -1.482831732494503 | -0.13 | 1.46 | 0.387 |
| -1.476548547187323 | -0.139 | 1.45 | 0.412 |
| -1.470265361880144 | -0.148 | 1.441 | 0.437 |
| -1.463982176572964 | -0.156 | 1.431 | 0.461 |
| -1.457698991265784 | -0.165 | 1.421 | 0.485 |
| -1.451415805958605 | -0.173 | 1.41 | 0.509 |
| -1.445132620651425 | -0.181 | 1.4 | 0.532 |
| -1.438849435344245 | -0.189 | 1.389 | 0.555 |
| -1.432566250037066 | -0.197 | 1.378 | 0.577 |
| -1.426283064729886 | -0.205 | 1.367 | 0.599 |
| -1.419999879422706 | -0.213 | 1.356 | 0.621 |
| -1.413716694115527 | -0.221 | 1.345 | 0.642 |
| -1.407433508808347 | -0.229 | 1.333 | 0.662 |
| -1.401150323501168 | -0.237 | 1.321 | 0.683 |
| -1.394867138193988 | -0.244 | 1.309 | 0.702 |
| -1.388583952886808 | -0.252 | 1.297 | 0.722 |
| -1.382300767579629 | -0.259 | 1.285 | 0.741 |
| -1.376017582272449 | -0.266 | 1.273 | 0.759 |
| -1.369734396965269 | -0.274 | 1.26 | 0.777 |
| -1.36345121165809 | -0.281 | 1.248 | 0.794 |
| -1.35716802635091 | -0.288 | 1.235 | 0.811 |
| -1.35088484104373 | -0.295 | 1.222 | 0.828 |
| -1.344601655736551 | -0.302 | 1.209 | 0.844 |
| -1.338318470429371 | -0.308 | 1.196 | 0.86 |
| -1.332035285122191 | -0.315 | 1.183 | 0.875 |
| -1.325752099815012 | -0.322 | 1.17 | 0.889 |
| -1.319468914507832 | -0.328 | 1.156 | 0.903 |
| -1.313185729200653 | -0.335 | 1.143 | 0.917 |
| -1.306902543893473 | -0.341 | 1.129 | 0.93 |
| -1.300619358586293 | -0.347 | 1.115 | 0.942 |
| -1.294336173279114 | -0.353 | 1.101 | 0.955 |
| -1.288052987971934 | -0.359 | 1.088 | 0.966 |
| -1.281769802664754 | -0.365 | 1.074 | 0.977 |
| -1.275486617357575 | -0.371 | 1.059 | 0.988 |
| -1.269203432050395 | -0.377 | 1.045 | 0.998 |
| -1.262920246743215 | -0.383 | 1.031 | 1.008 |
| -1.256637061436036 | -0.388 | 1.017 | 1.017 |
| -1.250353876128856 | -0.394 | 1.002 | 1.025 |
| -1.244070690821677 | -0.399 | 0.988 | 1.033 |
| -1.237787505514497 | -0.405 | 0.973 | 1.041 |
| -1.231504320207317 | -0.41 | 0.959 | 1.048 |
| -1.225221134900138 | -0.415 | 0.944 | 1.055 |
| -1.218937949592958 | -0.42 | 0.929 | 1.061 |
| -1.212654764285778 | -0.425 | 0.915 | 1.066 |
| -1.206371578978599 | -0.43 | 0.9 | 1.071 |
| -1.20008839367142 | -0.435 | 0.885 | 1.076 |
| -1.193805208364239 | -0.439 | 0.87 | 1.08 |
| -1.18752202305706 | -0.444 | 0.855 | 1.084 |
| -1.18123883774988 | -0.449 | 0.84 | 1.087 |
| -1.1749556524427 | -0.453 | 0.826 | 1.09 |
| -1.168672467135521 | -0.457 | 0.811 | 1.092 |
| -1.162389281828341 | -0.462 | 0.796 | 1.094 |
| -1.156106096521162 | -0.466 | 0.781 | 1.095 |
| -1.149822911213982 | -0.47 | 0.766 | 1.096 |
| -1.143539725906802 | -0.474 | 0.751 | 1.096 |
| -1.137256540599623 | -0.478 | 0.736 | 1.096 |
| -1.130973355292443 | -0.482 | 0.721 | 1.095 |
| -1.124690169985263 | -0.485 | 0.706 | 1.094 |
| -1.118406984678084 | -0.489 | 0.691 | 1.093 |
| -1.112123799370904 | -0.492 | 0.676 | 1.091 |
| -1.105840614063724 | -0.496 | 0.661 | 1.089 |
| -1.099557428756545 | -0.499 | 0.646 | 1.086 |
| -1.093274243449365 | -0.502 | 0.631 | 1.083 |
| -1.086991058142186 | -0.506 | 0.617 | 1.079 |
| -1.080707872835006 | -0.509 | 0.602 | 1.075 |
| -1.074424687527826 | -0.512 | 0.587 | 1.071 |
| -1.068141502220647 | -0.515 | 0.572 | 1.066 |
| -1.061858316913467 | -0.517 | 0.558 | 1.061 |
| -1.055575131606287 | -0.52 | 0.543 | 1.055 |
| -1.049291946299108 | -0.523 | 0.528 | 1.049 |
| -1.043008760991928 | -0.525 | 0.514 | 1.043 |
| -1.036725575684748 | -0.528 | 0.499 | 1.036 |
| -1.030442390377569 | -0.53 | 0.485 | 1.029 |
| -1.024159205070389 | -0.532 | 0.471 | 1.022 |
| -1.01787601976321 | -0.535 | 0.456 | 1.014 |
| -1.01159283445603 | -0.537 | 0.442 | 1.006 |
| -1.00530964914885 | -0.539 | 0.428 | 0.997 |
| -0.999026463841671 | -0.541 | 0.414 | 0.989 |
| -0.992743278534491 | -0.542 | 0.4 | 0.98 |
| -0.986460093227311 | -0.544 | 0.386 | 0.97 |
| -0.980176907920132 | -0.546 | 0.372 | 0.96 |
| -0.973893722612952 | -0.547 | 0.359 | 0.95 |
| -0.967610537305772 | -0.549 | 0.345 | 0.94 |
| -0.961327351998593 | -0.55 | 0.331 | 0.93 |
| -0.955044166691413 | -0.552 | 0.318 | 0.919 |
| -0.948760981384233 | -0.553 | 0.304 | 0.908 |
| -0.942477796077054 | -0.554 | 0.291 | 0.896 |
| -0.936194610769874 | -0.555 | 0.278 | 0.885 |
| -0.929911425462695 | -0.556 | 0.265 | 0.873 |
| -0.923628240155515 | -0.557 | 0.252 | 0.861 |
| -0.917345054848335 | -0.558 | 0.239 | 0.849 |
| -0.911061869541156 | -0.558 | 0.227 | 0.836 |
| -0.904778684233976 | -0.559 | 0.214 | 0.823 |
| -0.898495498926796 | -0.56 | 0.202 | 0.811 |
| -0.892212313619617 | -0.56 | 0.189 | 0.797 |
| -0.885929128312437 | -0.56 | 0.177 | 0.784 |
| -0.879645943005257 | -0.561 | 0.165 | 0.771 |
| -0.873362757698078 | -0.561 | 0.153 | 0.757 |
| -0.867079572390898 | -0.561 | 0.141 | 0.744 |
| -0.860796387083718 | -0.561 | 0.129 | 0.73 |
| -0.854513201776539 | -0.561 | 0.118 | 0.716 |
| -0.848230016469359 | -0.561 | 0.106 | 0.702 |
| -0.84194683116218 | -0.561 | 0.095 | 0.687 |
| -0.835663645855 | -0.56 | 0.084 | 0.673 |
| -0.82938046054782 | -0.56 | 0.073 | 0.659 |
| -0.823097275240641 | -0.56 | 0.062 | 0.644 |
| -0.816814089933461 | -0.559 | 0.051 | 0.629 |
| -0.810530904626281 | -0.559 | 0.041 | 0.615 |
| -0.804247719319102 | -0.558 | 0.03 | 0.6 |
| -0.797964534011922 | -0.557 | 0.02 | 0.585 |
| -0.791681348704742 | -0.556 | 0.01 | 0.57 |
| -0.785398163397563 | -0.555 | 0 | 0.555 |
| -0.779114978090383 | -0.554 | -0.01 | 0.54 |
| -0.772831792783204 | -0.553 | -0.019 | 0.525 |
| -0.766548607476024 | -0.552 | -0.029 | 0.511 |
| -0.760265422168844 | -0.551 | -0.038 | 0.496 |
| -0.753982236861665 | -0.55 | -0.047 | 0.481 |
| -0.747699051554485 | -0.548 | -0.056 | 0.466 |
| -0.741415866247305 | -0.547 | -0.065 | 0.451 |
| -0.735132680940126 | -0.545 | -0.074 | 0.436 |
| -0.728849495632946 | -0.544 | -0.082 | 0.421 |
| -0.722566310325766 | -0.542 | -0.091 | 0.406 |
| -0.716283125018587 | -0.54 | -0.099 | 0.391 |
| -0.709999939711407 | -0.538 | -0.107 | 0.377 |
| -0.703716754404227 | -0.537 | -0.114 | 0.362 |
| -0.697433569097048 | -0.535 | -0.122 | 0.347 |
| -0.691150383789868 | -0.533 | -0.13 | 0.333 |
| -0.684867198482689 | -0.53 | -0.137 | 0.319 |
| -0.678584013175509 | -0.528 | -0.144 | 0.304 |
| -0.672300827868329 | -0.526 | -0.151 | 0.29 |
| -0.66601764256115 | -0.524 | -0.158 | 0.276 |
| -0.65973445725397 | -0.521 | -0.164 | 0.262 |
| -0.65345127194679 | -0.519 | -0.17 | 0.248 |
| -0.647168086639611 | -0.516 | -0.177 | 0.234 |
| -0.640884901332431 | -0.514 | -0.183 | 0.221 |
| -0.634601716025251 | -0.511 | -0.189 | 0.207 |
| -0.628318530718072 | -0.508 | -0.194 | 0.194 |
| -0.622035345410892 | -0.506 | -0.2 | 0.181 |
| -0.615752160103712 | -0.503 | -0.205 | 0.168 |
| -0.609468974796533 | -0.5 | -0.21 | 0.155 |
| -0.603185789489353 | -0.497 | -0.215 | 0.143 |
| -0.596902604182174 | -0.494 | -0.22 | 0.13 |
| -0.590619418874994 | -0.491 | -0.224 | 0.118 |
| -0.584336233567814 | -0.487 | -0.229 | 0.106 |
| -0.578053048260635 | -0.484 | -0.233 | 0.094 |
| -0.571769862953455 | -0.481 | -0.237 | 0.082 |
| -0.565486677646275 | -0.477 | -0.241 | 0.071 |
| -0.559203492339096 | -0.474 | -0.244 | 0.06 |
| -0.552920307031916 | -0.471 | -0.248 | 0.049 |
| -0.546637121724737 | -0.467 | -0.251 | 0.038 |
| -0.540353936417557 | -0.463 | -0.254 | 0.027 |
| -0.534070751110377 | -0.46 | -0.257 | 0.017 |
| -0.527787565803198 | -0.456 | -0.26 | 0.007 |
| -0.521504380496018 | -0.452 | -0.263 | -0.003 |
| -0.515221195188838 | -0.448 | -0.265 | -0.013 |
| -0.508938009881659 | -0.444 | -0.267 | -0.022 |
| -0.502654824574479 | -0.44 | -0.269 | -0.032 |
| -0.496371639267299 | -0.436 | -0.271 | -0.04 |
| -0.49008845396012 | -0.432 | -0.273 | -0.049 |
| -0.48380526865294 | -0.428 | -0.274 | -0.058 |
| -0.477522083345761 | -0.424 | -0.276 | -0.066 |
| -0.471238898038581 | -0.42 | -0.277 | -0.074 |
| -0.464955712731402 | -0.416 | -0.278 | -0.081 |
| -0.458672527424222 | -0.411 | -0.279 | -0.089 |
| -0.452389342117042 | -0.407 | -0.28 | -0.096 |
| -0.446106156809863 | -0.402 | -0.28 | -0.103 |
| -0.439822971502683 | -0.398 | -0.28 | -0.109 |
| -0.433539786195504 | -0.393 | -0.281 | -0.116 |
| -0.427256600888324 | -0.389 | -0.281 | -0.122 |
| -0.420973415581144 | -0.384 | -0.28 | -0.128 |
| -0.414690230273965 | -0.38 | -0.28 | -0.133 |
| -0.408407044966785 | -0.375 | -0.28 | -0.138 |
| -0.402123859659606 | -0.37 | -0.279 | -0.143 |
| -0.395840674352426 | -0.365 | -0.278 | -0.148 |
| -0.389557489045247 | -0.36 | -0.277 | -0.152 |
| -0.383274303738067 | -0.355 | -0.276 | -0.157 |
| -0.376991118430887 | -0.351 | -0.275 | -0.161 |
| -0.370707933123708 | -0.346 | -0.273 | -0.164 |
| -0.364424747816528 | -0.34 | -0.272 | -0.167 |
| -0.358141562509349 | -0.335 | -0.27 | -0.171 |
| -0.351858377202169 | -0.33 | -0.268 | -0.173 |
| -0.345575191894989 | -0.325 | -0.266 | -0.176 |
| -0.33929200658781 | -0.32 | -0.264 | -0.178 |
| -0.33300882128063 | -0.315 | -0.262 | -0.18 |
| -0.326725635973451 | -0.309 | -0.259 | -0.182 |
| -0.320442450666271 | -0.304 | -0.257 | -0.183 |
| -0.314159265359092 | -0.299 | -0.254 | -0.185 |
| -0.307876080051912 | -0.293 | -0.251 | -0.186 |
| -0.301592894744732 | -0.288 | -0.248 | -0.186 |
| -0.295309709437553 | -0.283 | -0.245 | -0.187 |
| -0.289026524130373 | -0.277 | -0.242 | -0.187 |
| -0.282743338823194 | -0.272 | -0.239 | -0.187 |
| -0.276460153516014 | -0.266 | -0.235 | -0.187 |
| -0.270176968208834 | -0.26 | -0.232 | -0.186 |
| -0.263893782901655 | -0.255 | -0.228 | -0.185 |
| -0.257610597594475 | -0.249 | -0.224 | -0.184 |
| -0.251327412287296 | -0.243 | -0.22 | -0.183 |
| -0.245044226980116 | -0.238 | -0.216 | -0.182 |
| -0.238761041672937 | -0.232 | -0.212 | -0.18 |
| -0.232477856365757 | -0.226 | -0.208 | -0.178 |
| -0.226194671058577 | -0.22 | -0.203 | -0.176 |
| -0.219911485751398 | -0.215 | -0.199 | -0.174 |
| -0.213628300444218 | -0.209 | -0.194 | -0.171 |
| -0.207345115137039 | -0.203 | -0.19 | -0.169 |
| -0.201061929829859 | -0.197 | -0.185 | -0.166 |
| -0.194778744522679 | -0.191 | -0.18 | -0.162 |
| -0.1884955592155 | -0.185 | -0.175 | -0.159 |
| -0.18221237390832 | -0.179 | -0.17 | -0.156 |
| -0.175929188601141 | -0.173 | -0.165 | -0.152 |
| -0.169646003293961 | -0.167 | -0.16 | -0.148 |
| -0.163362817986782 | -0.161 | -0.155 | -0.144 |
| -0.157079632679602 | -0.155 | -0.149 | -0.14 |
| -0.150796447372422 | -0.149 | -0.144 | -0.136 |
| -0.144513262065243 | -0.143 | -0.139 | -0.131 |
| -0.138230076758063 | -0.137 | -0.133 | -0.127 |
| -0.131946891450884 | -0.131 | -0.127 | -0.122 |
| -0.125663706143704 | -0.125 | -0.122 | -0.117 |
| -0.119380520836524 | -0.119 | -0.116 | -0.112 |
| -0.113097335529345 | -0.112 | -0.11 | -0.107 |
| -0.106814150222165 | -0.106 | -0.104 | -0.101 |
| -0.100530964914986 | -0.1 | -0.099 | -0.096 |
| -0.0942477796078061 | -0.094 | -0.093 | -0.091 |
| -0.0879645943006265 | -0.088 | -0.087 | -0.085 |
| -0.0816814089934469 | -0.081 | -0.081 | -0.079 |
| -0.0753982236862674 | -0.075 | -0.075 | -0.073 |
| -0.0691150383790878 | -0.069 | -0.068 | -0.068 |
| -0.0628318530719082 | -0.063 | -0.062 | -0.062 |
| -0.0565486677647286 | -0.056 | -0.056 | -0.056 |
| -0.050265482457549 | -0.05 | -0.05 | -0.05 |
| -0.0439822971503694 | -0.044 | -0.044 | -0.044 |
| -0.0376991118431899 | -0.038 | -0.038 | -0.037 |
| -0.0314159265360103 | -0.031 | -0.031 | -0.031 |
| -0.0251327412288307 | -0.025 | -0.025 | -0.025 |
| -0.0188495559216511 | -0.019 | -0.019 | -0.019 |
| -0.0125663706144715 | -0.013 | -0.013 | -0.013 |
| -0.00628318530729192 | -0.006 | -0.006 | -0.006 |
| -1.12338957580782e-13 | 0 | 0 | 0 |
| 0.00628318530706725 | 0.006 | 0.006 | 0.006 |
| 0.0125663706142468 | 0.013 | 0.013 | 0.013 |
| 0.0188495559214264 | 0.019 | 0.019 | 0.019 |
| 0.025132741228606 | 0.025 | 0.025 | 0.025 |
| 0.0314159265357856 | 0.031 | 0.031 | 0.031 |
| 0.0376991118429652 | 0.038 | 0.038 | 0.037 |
| 0.0439822971501448 | 0.044 | 0.044 | 0.044 |
| 0.0502654824573243 | 0.05 | 0.05 | 0.05 |
| 0.0565486677645039 | 0.056 | 0.056 | 0.056 |
| 0.0628318530716835 | 0.063 | 0.062 | 0.062 |
| 0.0691150383788631 | 0.069 | 0.068 | 0.068 |
| 0.0753982236860427 | 0.075 | 0.075 | 0.073 |
| 0.0816814089932222 | 0.081 | 0.081 | 0.079 |
| 0.0879645943004018 | 0.088 | 0.087 | 0.085 |
| 0.0942477796075814 | 0.094 | 0.093 | 0.091 |
| 0.100530964914761 | 0.1 | 0.099 | 0.096 |
| 0.106814150221941 | 0.106 | 0.104 | 0.101 |
| 0.11309733552912 | 0.112 | 0.11 | 0.107 |
| 0.1193805208363 | 0.119 | 0.116 | 0.112 |
| 0.125663706143479 | 0.125 | 0.122 | 0.117 |
| 0.131946891450659 | 0.131 | 0.127 | 0.122 |
| 0.138230076757839 | 0.137 | 0.133 | 0.127 |
| 0.144513262065018 | 0.143 | 0.139 | 0.131 |
| 0.150796447372198 | 0.149 | 0.144 | 0.136 |
| 0.157079632679377 | 0.155 | 0.149 | 0.14 |
| 0.163362817986557 | 0.161 | 0.155 | 0.144 |
| 0.169646003293736 | 0.167 | 0.16 | 0.148 |
| 0.175929188600916 | 0.173 | 0.165 | 0.152 |
| 0.182212373908096 | 0.179 | 0.17 | 0.156 |
| 0.188495559215275 | 0.185 | 0.175 | 0.159 |
| 0.194778744522455 | 0.191 | 0.18 | 0.162 |
| 0.201061929829634 | 0.197 | 0.185 | 0.166 |
| 0.207345115136814 | 0.203 | 0.19 | 0.169 |
| 0.213628300443994 | 0.209 | 0.194 | 0.171 |
| 0.219911485751173 | 0.215 | 0.199 | 0.174 |
| 0.226194671058353 | 0.22 | 0.203 | 0.176 |
| 0.232477856365532 | 0.226 | 0.208 | 0.178 |
| 0.238761041672712 | 0.232 | 0.212 | 0.18 |
| 0.245044226979891 | 0.238 | 0.216 | 0.182 |
| 0.251327412287071 | 0.243 | 0.22 | 0.183 |
| 0.257610597594251 | 0.249 | 0.224 | 0.184 |
| 0.26389378290143 | 0.255 | 0.228 | 0.185 |
| 0.27017696820861 | 0.26 | 0.232 | 0.186 |
| 0.276460153515789 | 0.266 | 0.235 | 0.187 |
| 0.282743338822969 | 0.272 | 0.239 | 0.187 |
| 0.289026524130149 | 0.277 | 0.242 | 0.187 |
| 0.295309709437328 | 0.283 | 0.245 | 0.187 |
| 0.301592894744508 | 0.288 | 0.248 | 0.186 |
| 0.307876080051687 | 0.293 | 0.251 | 0.186 |
| 0.314159265358867 | 0.299 | 0.254 | 0.185 |
| 0.320442450666046 | 0.304 | 0.257 | 0.183 |
| 0.326725635973226 | 0.309 | 0.259 | 0.182 |
| 0.333008821280406 | 0.315 | 0.262 | 0.18 |
| 0.339292006587585 | 0.32 | 0.264 | 0.178 |
| 0.345575191894765 | 0.325 | 0.266 | 0.176 |
| 0.351858377201944 | 0.33 | 0.268 | 0.173 |
| 0.358141562509124 | 0.335 | 0.27 | 0.171 |
| 0.364424747816304 | 0.34 | 0.272 | 0.167 |
| 0.370707933123483 | 0.346 | 0.273 | 0.164 |
| 0.376991118430663 | 0.351 | 0.275 | 0.161 |
| 0.383274303737842 | 0.355 | 0.276 | 0.157 |
| 0.389557489045022 | 0.36 | 0.277 | 0.152 |
| 0.395840674352201 | 0.365 | 0.278 | 0.148 |
| 0.402123859659381 | 0.37 | 0.279 | 0.143 |
| 0.408407044966561 | 0.375 | 0.28 | 0.138 |
| 0.41469023027374 | 0.38 | 0.28 | 0.133 |
| 0.42097341558092 | 0.384 | 0.28 | 0.128 |
| 0.427256600888099 | 0.389 | 0.281 | 0.122 |
| 0.433539786195279 | 0.393 | 0.281 | 0.116 |
| 0.439822971502459 | 0.398 | 0.28 | 0.109 |
| 0.446106156809638 | 0.402 | 0.28 | 0.103 |
| 0.452389342116818 | 0.407 | 0.28 | 0.096 |
| 0.458672527423997 | 0.411 | 0.279 | 0.089 |
| 0.464955712731177 | 0.416 | 0.278 | 0.081 |
| 0.471238898038356 | 0.42 | 0.277 | 0.074 |
| 0.477522083345536 | 0.424 | 0.276 | 0.066 |
| 0.483805268652716 | 0.428 | 0.274 | 0.058 |
| 0.490088453959895 | 0.432 | 0.273 | 0.049 |
| 0.496371639267075 | 0.436 | 0.271 | 0.04 |
| 0.502654824574254 | 0.44 | 0.269 | 0.032 |
| 0.508938009881434 | 0.444 | 0.267 | 0.022 |
| 0.515221195188614 | 0.448 | 0.265 | 0.013 |
| 0.521504380495793 | 0.452 | 0.263 | 0.003 |
| 0.527787565802973 | 0.456 | 0.26 | -0.007 |
| 0.534070751110153 | 0.46 | 0.257 | -0.017 |
| 0.540353936417332 | 0.463 | 0.254 | -0.027 |
| 0.546637121724512 | 0.467 | 0.251 | -0.038 |
| 0.552920307031692 | 0.471 | 0.248 | -0.049 |
| 0.559203492338871 | 0.474 | 0.244 | -0.06 |
| 0.565486677646051 | 0.477 | 0.241 | -0.071 |
| 0.571769862953231 | 0.481 | 0.237 | -0.082 |
| 0.57805304826041 | 0.484 | 0.233 | -0.094 |
| 0.58433623356759 | 0.487 | 0.229 | -0.106 |
| 0.590619418874769 | 0.491 | 0.224 | -0.118 |
| 0.596902604181949 | 0.494 | 0.22 | -0.13 |
| 0.603185789489129 | 0.497 | 0.215 | -0.143 |
| 0.609468974796308 | 0.5 | 0.21 | -0.155 |
| 0.615752160103488 | 0.503 | 0.205 | -0.168 |
| 0.622035345410668 | 0.506 | 0.2 | -0.181 |
| 0.628318530717847 | 0.508 | 0.194 | -0.194 |
| 0.634601716025027 | 0.511 | 0.189 | -0.207 |
| 0.640884901332206 | 0.514 | 0.183 | -0.221 |
| 0.647168086639386 | 0.516 | 0.177 | -0.234 |
| 0.653451271946566 | 0.519 | 0.17 | -0.248 |
| 0.659734457253745 | 0.521 | 0.164 | -0.262 |
| 0.666017642560925 | 0.524 | 0.158 | -0.276 |
| 0.672300827868105 | 0.526 | 0.151 | -0.29 |
| 0.678584013175284 | 0.528 | 0.144 | -0.304 |
| 0.684867198482464 | 0.53 | 0.137 | -0.319 |
| 0.691150383789644 | 0.533 | 0.13 | -0.333 |
| 0.697433569096823 | 0.535 | 0.122 | -0.347 |
| 0.703716754404003 | 0.537 | 0.114 | -0.362 |
| 0.709999939711183 | 0.538 | 0.107 | -0.377 |
| 0.716283125018362 | 0.54 | 0.099 | -0.391 |
| 0.722566310325542 | 0.542 | 0.091 | -0.406 |
| 0.728849495632721 | 0.544 | 0.082 | -0.421 |
| 0.735132680939901 | 0.545 | 0.074 | -0.436 |
| 0.741415866247081 | 0.547 | 0.065 | -0.451 |
| 0.74769905155426 | 0.548 | 0.056 | -0.466 |
| 0.75398223686144 | 0.55 | 0.047 | -0.481 |
| 0.76026542216862 | 0.551 | 0.038 | -0.496 |
| 0.766548607475799 | 0.552 | 0.029 | -0.511 |
| 0.772831792782979 | 0.553 | 0.019 | -0.525 |
| 0.779114978090159 | 0.554 | 0.01 | -0.54 |
| 0.785398163397338 | 0.555 | 0 | -0.555 |
| 0.791681348704518 | 0.556 | -0.01 | -0.57 |
| 0.797964534011697 | 0.557 | -0.02 | -0.585 |
| 0.804247719318877 | 0.558 | -0.03 | -0.6 |
| 0.810530904626057 | 0.559 | -0.041 | -0.615 |
| 0.816814089933236 | 0.559 | -0.051 | -0.629 |
| 0.823097275240416 | 0.56 | -0.062 | -0.644 |
| 0.829380460547596 | 0.56 | -0.073 | -0.659 |
| 0.835663645854775 | 0.56 | -0.084 | -0.673 |
| 0.841946831161955 | 0.561 | -0.095 | -0.687 |
| 0.848230016469135 | 0.561 | -0.106 | -0.702 |
| 0.854513201776314 | 0.561 | -0.118 | -0.716 |
| 0.860796387083494 | 0.561 | -0.129 | -0.73 |
| 0.867079572390674 | 0.561 | -0.141 | -0.744 |
| 0.873362757697853 | 0.561 | -0.153 | -0.757 |
| 0.879645943005033 | 0.561 | -0.165 | -0.771 |
| 0.885929128312212 | 0.56 | -0.177 | -0.784 |
| 0.892212313619392 | 0.56 | -0.189 | -0.797 |
| 0.898495498926572 | 0.56 | -0.202 | -0.811 |
| 0.904778684233751 | 0.559 | -0.214 | -0.823 |
| 0.911061869540931 | 0.558 | -0.227 | -0.836 |
| 0.917345054848111 | 0.558 | -0.239 | -0.849 |
| 0.92362824015529 | 0.557 | -0.252 | -0.861 |
| 0.92991142546247 | 0.556 | -0.265 | -0.873 |
| 0.93619461076965 | 0.555 | -0.278 | -0.885 |
| 0.942477796076829 | 0.554 | -0.291 | -0.896 |
| 0.948760981384009 | 0.553 | -0.304 | -0.908 |
| 0.955044166691188 | 0.552 | -0.318 | -0.919 |
| 0.961327351998368 | 0.55 | -0.331 | -0.93 |
| 0.967610537305548 | 0.549 | -0.345 | -0.94 |
| 0.973893722612727 | 0.547 | -0.359 | -0.95 |
| 0.980176907919907 | 0.546 | -0.372 | -0.96 |
| 0.986460093227087 | 0.544 | -0.386 | -0.97 |
| 0.992743278534266 | 0.542 | -0.4 | -0.98 |
| 0.999026463841446 | 0.541 | -0.414 | -0.989 |
| 1.005309649148626 | 0.539 | -0.428 | -0.997 |
| 1.011592834455805 | 0.537 | -0.442 | -1.006 |
| 1.017876019762985 | 0.535 | -0.456 | -1.014 |
| 1.024159205070164 | 0.532 | -0.471 | -1.022 |
| 1.030442390377344 | 0.53 | -0.485 | -1.029 |
| 1.036725575684524 | 0.528 | -0.499 | -1.036 |
| 1.043008760991703 | 0.525 | -0.514 | -1.043 |
| 1.049291946298883 | 0.523 | -0.528 | -1.049 |
| 1.055575131606063 | 0.52 | -0.543 | -1.055 |
| 1.061858316913242 | 0.517 | -0.558 | -1.061 |
| 1.068141502220422 | 0.515 | -0.572 | -1.066 |
| 1.074424687527602 | 0.512 | -0.587 | -1.071 |
| 1.080707872834781 | 0.509 | -0.602 | -1.075 |
| 1.086991058141961 | 0.506 | -0.617 | -1.079 |
| 1.09327424344914 | 0.502 | -0.631 | -1.083 |
| 1.09955742875632 | 0.499 | -0.646 | -1.086 |
| 1.1058406140635 | 0.496 | -0.661 | -1.089 |
| 1.112123799370679 | 0.492 | -0.676 | -1.091 |
| 1.11840698467786 | 0.489 | -0.691 | -1.093 |
| 1.124690169985039 | 0.485 | -0.706 | -1.094 |
| 1.130973355292218 | 0.482 | -0.721 | -1.095 |
| 1.137256540599398 | 0.478 | -0.736 | -1.096 |
| 1.143539725906578 | 0.474 | -0.751 | -1.096 |
| 1.149822911213757 | 0.47 | -0.766 | -1.096 |
| 1.156106096520937 | 0.466 | -0.781 | -1.095 |
| 1.162389281828116 | 0.462 | -0.796 | -1.094 |
| 1.168672467135296 | 0.457 | -0.811 | -1.092 |
| 1.174955652442476 | 0.453 | -0.826 | -1.09 |
| 1.181238837749655 | 0.449 | -0.84 | -1.087 |
| 1.187522023056835 | 0.444 | -0.855 | -1.084 |
| 1.193805208364015 | 0.439 | -0.87 | -1.08 |
| 1.200088393671194 | 0.435 | -0.885 | -1.076 |
| 1.206371578978374 | 0.43 | -0.9 | -1.071 |
| 1.212654764285554 | 0.425 | -0.915 | -1.066 |
| 1.218937949592733 | 0.42 | -0.929 | -1.061 |
| 1.225221134899913 | 0.415 | -0.944 | -1.055 |
| 1.231504320207093 | 0.41 | -0.959 | -1.048 |
| 1.237787505514272 | 0.405 | -0.973 | -1.041 |
| 1.244070690821452 | 0.399 | -0.988 | -1.033 |
| 1.250353876128631 | 0.394 | -1.002 | -1.025 |
| 1.256637061435811 | 0.388 | -1.017 | -1.017 |
| 1.262920246742991 | 0.383 | -1.031 | -1.008 |
| 1.26920343205017 | 0.377 | -1.045 | -0.998 |
| 1.27548661735735 | 0.371 | -1.059 | -0.988 |
| 1.28176980266453 | 0.365 | -1.074 | -0.977 |
| 1.28805298797171 | 0.359 | -1.088 | -0.966 |
| 1.294336173278889 | 0.353 | -1.101 | -0.955 |
| 1.300619358586069 | 0.347 | -1.115 | -0.942 |
| 1.306902543893248 | 0.341 | -1.129 | -0.93 |
| 1.313185729200428 | 0.335 | -1.143 | -0.917 |
| 1.319468914507607 | 0.328 | -1.156 | -0.903 |
| 1.325752099814787 | 0.322 | -1.17 | -0.889 |
| 1.332035285121967 | 0.315 | -1.183 | -0.875 |
| 1.338318470429146 | 0.308 | -1.196 | -0.86 |
| 1.344601655736326 | 0.302 | -1.209 | -0.844 |
| 1.350884841043506 | 0.295 | -1.222 | -0.828 |
| 1.357168026350685 | 0.288 | -1.235 | -0.811 |
| 1.363451211657865 | 0.281 | -1.248 | -0.794 |
| 1.369734396965045 | 0.274 | -1.26 | -0.777 |
| 1.376017582272224 | 0.266 | -1.273 | -0.759 |
| 1.382300767579404 | 0.259 | -1.285 | -0.741 |
| 1.388583952886583 | 0.252 | -1.297 | -0.722 |
| 1.394867138193763 | 0.244 | -1.309 | -0.702 |
| 1.401150323500943 | 0.237 | -1.321 | -0.683 |
| 1.407433508808122 | 0.229 | -1.333 | -0.662 |
| 1.413716694115302 | 0.221 | -1.345 | -0.642 |
| 1.419999879422482 | 0.213 | -1.356 | -0.621 |
| 1.426283064729661 | 0.205 | -1.367 | -0.599 |
| 1.432566250036841 | 0.197 | -1.378 | -0.577 |
| 1.438849435344021 | 0.189 | -1.389 | -0.555 |
| 1.4451326206512 | 0.181 | -1.4 | -0.532 |
| 1.45141580595838 | 0.173 | -1.41 | -0.509 |
| 1.45769899126556 | 0.165 | -1.421 | -0.485 |
| 1.46398217657274 | 0.156 | -1.431 | -0.461 |
| 1.470265361879919 | 0.148 | -1.441 | -0.437 |
| 1.476548547187098 | 0.139 | -1.45 | -0.412 |
| 1.482831732494278 | 0.13 | -1.46 | -0.387 |
| 1.489114917801458 | 0.121 | -1.469 | -0.361 |
| 1.495398103108637 | 0.113 | -1.478 | -0.335 |
| 1.501681288415817 | 0.104 | -1.487 | -0.309 |
| 1.507964473722997 | 0.095 | -1.496 | -0.283 |
| 1.514247659030176 | 0.086 | -1.505 | -0.256 |
| 1.520530844337356 | 0.076 | -1.513 | -0.228 |
| 1.526814029644536 | 0.067 | -1.521 | -0.201 |
| 1.533097214951715 | 0.058 | -1.529 | -0.173 |
| 1.539380400258895 | 0.048 | -1.536 | -0.145 |
| 1.545663585566075 | 0.039 | -1.544 | -0.116 |
| 1.551946770873254 | 0.029 | -1.551 | -0.088 |
| 1.558229956180434 | 0.02 | -1.558 | -0.059 |
| 1.564513141487613 | 0.01 | -1.564 | -0.029 |
| 1.570796326794793 | 0 | -1.571 | 0 |
| 1.577079512101973 | -0.01 | -1.577 | 0.03 |
| 1.583362697409152 | -0.02 | -1.583 | 0.06 |
| 1.589645882716332 | -0.03 | -1.589 | 0.09 |
| 1.595929068023512 | -0.04 | -1.594 | 0.12 |
| 1.602212253330691 | -0.05 | -1.599 | 0.151 |
| 1.608495438637871 | -0.061 | -1.604 | 0.182 |
| 1.61477862394505 | -0.071 | -1.609 | 0.212 |
| 1.62106180925223 | -0.081 | -1.613 | 0.244 |
| 1.62734499455941 | -0.092 | -1.617 | 0.275 |
| 1.633628179866589 | -0.103 | -1.621 | 0.306 |
| 1.63991136517377 | -0.113 | -1.624 | 0.338 |
| 1.646194550480949 | -0.124 | -1.628 | 0.369 |
| 1.652477735788128 | -0.135 | -1.63 | 0.401 |
| 1.658760921095308 | -0.146 | -1.633 | 0.433 |
| 1.665044106402488 | -0.157 | -1.636 | 0.465 |
| 1.671327291709667 | -0.168 | -1.638 | 0.496 |
| 1.677610477016847 | -0.179 | -1.639 | 0.528 |
| 1.683893662324026 | -0.19 | -1.641 | 0.56 |
| 1.690176847631206 | -0.201 | -1.642 | 0.592 |
| 1.696460032938386 | -0.213 | -1.643 | 0.625 |
| 1.702743218245565 | -0.224 | -1.644 | 0.657 |
| 1.709026403552745 | -0.235 | -1.644 | 0.689 |
| 1.715309588859925 | -0.247 | -1.644 | 0.721 |
| 1.721592774167104 | -0.259 | -1.644 | 0.753 |
| 1.727875959474284 | -0.27 | -1.643 | 0.784 |
| 1.734159144781464 | -0.282 | -1.642 | 0.816 |
| 1.740442330088643 | -0.294 | -1.641 | 0.848 |
| 1.746725515395823 | -0.306 | -1.64 | 0.88 |
| 1.753008700703003 | -0.318 | -1.638 | 0.911 |
| 1.759291886010182 | -0.33 | -1.636 | 0.943 |
| 1.765575071317362 | -0.342 | -1.633 | 0.974 |
| 1.771858256624541 | -0.354 | -1.631 | 1.005 |
| 1.778141441931721 | -0.366 | -1.627 | 1.036 |
| 1.784424627238901 | -0.378 | -1.624 | 1.067 |
| 1.79070781254608 | -0.391 | -1.62 | 1.098 |
| 1.79699099785326 | -0.403 | -1.616 | 1.128 |
| 1.80327418316044 | -0.415 | -1.612 | 1.158 |
| 1.809557368467619 | -0.428 | -1.607 | 1.188 |
| 1.815840553774799 | -0.441 | -1.602 | 1.218 |
| 1.822123739081979 | -0.453 | -1.597 | 1.247 |
| 1.828406924389158 | -0.466 | -1.591 | 1.277 |
| 1.834690109696338 | -0.479 | -1.585 | 1.305 |
| 1.840973295003518 | -0.491 | -1.579 | 1.334 |
| 1.847256480310697 | -0.504 | -1.572 | 1.362 |
| 1.853539665617877 | -0.517 | -1.565 | 1.39 |
| 1.859822850925056 | -0.53 | -1.558 | 1.418 |
| 1.866106036232236 | -0.543 | -1.55 | 1.445 |
| 1.872389221539416 | -0.556 | -1.542 | 1.472 |
| 1.878672406846595 | -0.569 | -1.534 | 1.499 |
| 1.884955592153775 | -0.582 | -1.525 | 1.525 |
| 1.891238777460955 | -0.596 | -1.516 | 1.551 |
| 1.897521962768134 | -0.609 | -1.507 | 1.576 |
| 1.903805148075314 | -0.622 | -1.497 | 1.601 |
| 1.910088333382494 | -0.636 | -1.487 | 1.625 |
| 1.916371518689673 | -0.649 | -1.477 | 1.65 |
| 1.922654703996853 | -0.663 | -1.466 | 1.673 |
| 1.928937889304033 | -0.676 | -1.455 | 1.696 |
| 1.935221074611212 | -0.69 | -1.444 | 1.719 |
| 1.941504259918392 | -0.703 | -1.432 | 1.741 |
| 1.947787445225571 | -0.717 | -1.42 | 1.762 |
| 1.954070630532751 | -0.731 | -1.408 | 1.783 |
| 1.960353815839931 | -0.745 | -1.395 | 1.804 |
| 1.96663700114711 | -0.758 | -1.382 | 1.824 |
| 1.97292018645429 | -0.772 | -1.369 | 1.843 |
| 1.97920337176147 | -0.786 | -1.355 | 1.862 |
| 1.985486557068649 | -0.8 | -1.341 | 1.88 |
| 1.991769742375829 | -0.814 | -1.327 | 1.898 |
| 1.998052927683009 | -0.828 | -1.312 | 1.915 |
| 2.004336112990188 | -0.842 | -1.297 | 1.932 |
| 2.010619298297368 | -0.856 | -1.282 | 1.947 |
| 2.016902483604547 | -0.87 | -1.266 | 1.963 |
| 2.023185668911727 | -0.884 | -1.25 | 1.977 |
| 2.029468854218907 | -0.899 | -1.234 | 1.991 |
| 2.035752039526086 | -0.913 | -1.217 | 2.004 |
| 2.042035224833266 | -0.927 | -1.2 | 2.017 |
| 2.048318410140446 | -0.941 | -1.183 | 2.029 |
| 2.054601595447625 | -0.956 | -1.166 | 2.04 |
| 2.060884780754805 | -0.97 | -1.148 | 2.05 |
| 2.067167966061984 | -0.984 | -1.129 | 2.06 |
| 2.073451151369164 | -0.999 | -1.111 | 2.069 |
| 2.079734336676344 | -1.013 | -1.092 | 2.078 |
| 2.086017521983524 | -1.028 | -1.073 | 2.085 |
| 2.092300707290703 | -1.042 | -1.054 | 2.092 |
| 2.098583892597883 | -1.057 | -1.034 | 2.098 |
| 2.104867077905062 | -1.071 | -1.014 | 2.104 |
| 2.111150263212242 | -1.086 | -0.994 | 2.108 |
| 2.117433448519422 | -1.101 | -0.973 | 2.112 |
| 2.123716633826601 | -1.115 | -0.952 | 2.116 |
| 2.129999819133781 | -1.13 | -0.931 | 2.118 |
| 2.136283004440961 | -1.145 | -0.91 | 2.119 |
| 2.14256618974814 | -1.159 | -0.888 | 2.12 |
| 2.14884937505532 | -1.174 | -0.866 | 2.12 |
| 2.1551325603625 | -1.189 | -0.843 | 2.119 |
| 2.16141574566968 | -1.204 | -0.821 | 2.118 |
| 2.167698930976859 | -1.218 | -0.798 | 2.115 |
| 2.173982116284038 | -1.233 | -0.775 | 2.112 |
| 2.180265301591218 | -1.248 | -0.751 | 2.108 |
| 2.186548486898398 | -1.263 | -0.728 | 2.104 |
| 2.192831672205577 | -1.278 | -0.704 | 2.098 |
| 2.199114857512757 | -1.293 | -0.68 | 2.091 |
| 2.205398042819936 | -1.307 | -0.655 | 2.084 |
| 2.211681228127116 | -1.322 | -0.63 | 2.076 |
| 2.217964413434296 | -1.337 | -0.605 | 2.067 |
| 2.224247598741475 | -1.352 | -0.58 | 2.058 |
| 2.230530784048655 | -1.367 | -0.555 | 2.047 |
| 2.236813969355835 | -1.382 | -0.529 | 2.036 |
| 2.243097154663014 | -1.397 | -0.503 | 2.024 |
| 2.249380339970194 | -1.412 | -0.477 | 2.011 |
| 2.255663525277374 | -1.427 | -0.45 | 1.997 |
| 2.261946710584553 | -1.442 | -0.424 | 1.982 |
| 2.268229895891733 | -1.457 | -0.397 | 1.967 |
| 2.274513081198912 | -1.472 | -0.37 | 1.95 |
| 2.280796266506092 | -1.487 | -0.343 | 1.933 |
| 2.287079451813272 | -1.502 | -0.315 | 1.915 |
| 2.293362637120452 | -1.517 | -0.287 | 1.897 |
| 2.299645822427631 | -1.532 | -0.26 | 1.877 |
| 2.305929007734811 | -1.547 | -0.231 | 1.857 |
| 2.312212193041991 | -1.562 | -0.203 | 1.836 |
| 2.31849537834917 | -1.576 | -0.175 | 1.814 |
| 2.32477856365635 | -1.591 | -0.146 | 1.791 |
| 2.331061748963529 | -1.606 | -0.117 | 1.768 |
| 2.337344934270709 | -1.621 | -0.088 | 1.744 |
| 2.343628119577889 | -1.636 | -0.059 | 1.718 |
| 2.349911304885068 | -1.651 | -0.03 | 1.693 |
| 2.356194490192248 | -1.666 | 0 | 1.666 |
| 2.362477675499428 | -1.681 | 0.03 | 1.639 |
| 2.368760860806607 | -1.696 | 0.06 | 1.611 |
| 2.375044046113787 | -1.711 | 0.09 | 1.582 |
| 2.381327231420966 | -1.726 | 0.12 | 1.552 |
| 2.387610416728146 | -1.74 | 0.15 | 1.522 |
| 2.393893602035326 | -1.755 | 0.18 | 1.491 |
| 2.400176787342505 | -1.77 | 0.211 | 1.459 |
| 2.406459972649685 | -1.785 | 0.242 | 1.427 |
| 2.412743157956865 | -1.8 | 0.272 | 1.394 |
| 2.419026343264044 | -1.815 | 0.303 | 1.36 |
| 2.425309528571224 | -1.829 | 0.334 | 1.325 |
| 2.431592713878404 | -1.844 | 0.365 | 1.29 |
| 2.437875899185583 | -1.859 | 0.396 | 1.254 |
| 2.444159084492763 | -1.873 | 0.428 | 1.218 |
| 2.450442269799943 | -1.888 | 0.459 | 1.181 |
| 2.456725455107122 | -1.903 | 0.491 | 1.143 |
| 2.463008640414302 | -1.917 | 0.522 | 1.104 |
| 2.469291825721482 | -1.932 | 0.554 | 1.065 |
| 2.475575011028661 | -1.947 | 0.585 | 1.026 |
| 2.481858196335841 | -1.961 | 0.617 | 0.986 |
| 2.48814138164302 | -1.976 | 0.649 | 0.945 |
| 2.4944245669502 | -1.99 | 0.681 | 0.904 |
| 2.50070775225738 | -2.004 | 0.713 | 0.862 |
| 2.506990937564559 | -2.019 | 0.745 | 0.82 |
| 2.51327412287174 | -2.033 | 0.777 | 0.777 |
| 2.519557308178919 | -2.048 | 0.809 | 0.733 |
| 2.525840493486098 | -2.062 | 0.841 | 0.689 |
| 2.532123678793278 | -2.076 | 0.873 | 0.645 |
| 2.538406864100458 | -2.09 | 0.905 | 0.6 |
| 2.544690049407637 | -2.105 | 0.937 | 0.555 |
| 2.550973234714817 | -2.119 | 0.969 | 0.509 |
| 2.557256420021996 | -2.133 | 1.001 | 0.463 |
| 2.563539605329176 | -2.147 | 1.033 | 0.417 |
| 2.569822790636356 | -2.161 | 1.065 | 0.37 |
| 2.576105975943535 | -2.175 | 1.097 | 0.323 |
| 2.582389161250715 | -2.189 | 1.129 | 0.275 |
| 2.588672346557895 | -2.203 | 1.161 | 0.227 |
| 2.594955531865074 | -2.217 | 1.193 | 0.179 |
| 2.601238717172254 | -2.231 | 1.224 | 0.131 |
| 2.607521902479433 | -2.244 | 1.256 | 0.082 |
| 2.613805087786613 | -2.258 | 1.288 | 0.033 |
| 2.620088273093793 | -2.272 | 1.32 | -0.016 |
| 2.626371458400972 | -2.285 | 1.351 | -0.066 |
| 2.632654643708152 | -2.299 | 1.383 | -0.116 |
| 2.638937829015332 | -2.313 | 1.414 | -0.166 |
| 2.645221014322511 | -2.326 | 1.445 | -0.216 |
| 2.651504199629691 | -2.339 | 1.477 | -0.266 |
| 2.657787384936871 | -2.353 | 1.508 | -0.317 |
| 2.66407057024405 | -2.366 | 1.539 | -0.367 |
| 2.67035375555123 | -2.379 | 1.57 | -0.418 |
| 2.67663694085841 | -2.392 | 1.6 | -0.468 |
| 2.682920126165589 | -2.406 | 1.631 | -0.519 |
| 2.689203311472769 | -2.419 | 1.662 | -0.57 |
| 2.695486496779948 | -2.432 | 1.692 | -0.621 |
| 2.701769682087128 | -2.445 | 1.722 | -0.672 |
| 2.708052867394308 | -2.458 | 1.752 | -0.723 |
| 2.714336052701487 | -2.47 | 1.782 | -0.774 |
| 2.720619238008667 | -2.483 | 1.812 | -0.824 |
| 2.726902423315847 | -2.496 | 1.842 | -0.875 |
| 2.733185608623026 | -2.508 | 1.871 | -0.926 |
| 2.739468793930206 | -2.521 | 1.9 | -0.976 |
| 2.745751979237386 | -2.533 | 1.929 | -1.027 |
| 2.752035164544565 | -2.546 | 1.958 | -1.077 |
| 2.758318349851745 | -2.558 | 1.987 | -1.127 |
| 2.764601535158925 | -2.57 | 2.015 | -1.177 |
| 2.770884720466104 | -2.583 | 2.044 | -1.227 |
| 2.777167905773284 | -2.595 | 2.072 | -1.276 |
| 2.783451091080463 | -2.607 | 2.099 | -1.326 |
| 2.789734276387643 | -2.619 | 2.127 | -1.375 |
| 2.796017461694823 | -2.631 | 2.154 | -1.423 |
| 2.802300647002002 | -2.643 | 2.181 | -1.472 |
| 2.808583832309182 | -2.654 | 2.208 | -1.52 |
| 2.814867017616362 | -2.666 | 2.235 | -1.568 |
| 2.821150202923541 | -2.678 | 2.261 | -1.615 |
| 2.827433388230721 | -2.689 | 2.287 | -1.662 |
| 2.833716573537901 | -2.7 | 2.313 | -1.709 |
| 2.83999975884508 | -2.712 | 2.339 | -1.755 |
| 2.84628294415226 | -2.723 | 2.364 | -1.8 |
| 2.852566129459439 | -2.734 | 2.389 | -1.846 |
| 2.858849314766619 | -2.745 | 2.414 | -1.891 |
| 2.865132500073799 | -2.756 | 2.438 | -1.935 |
| 2.871415685380978 | -2.767 | 2.462 | -1.979 |
| 2.877698870688158 | -2.778 | 2.486 | -2.022 |
| 2.883982055995337 | -2.789 | 2.51 | -2.065 |
| 2.890265241302517 | -2.799 | 2.533 | -2.107 |
| 2.896548426609697 | -2.81 | 2.556 | -2.148 |
| 2.902831611916877 | -2.82 | 2.578 | -2.189 |
| 2.909114797224056 | -2.831 | 2.6 | -2.23 |
| 2.915397982531236 | -2.841 | 2.622 | -2.27 |
| 2.921681167838416 | -2.851 | 2.644 | -2.309 |
| 2.927964353145595 | -2.861 | 2.665 | -2.347 |
| 2.934247538452775 | -2.871 | 2.686 | -2.385 |
| 2.940530723759954 | -2.881 | 2.706 | -2.422 |
| 2.946813909067134 | -2.891 | 2.726 | -2.458 |
| 2.953097094374314 | -2.901 | 2.746 | -2.493 |
| 2.959380279681493 | -2.91 | 2.765 | -2.528 |
| 2.965663464988673 | -2.92 | 2.784 | -2.562 |
| 2.971946650295853 | -2.929 | 2.803 | -2.595 |
| 2.978229835603032 | -2.939 | 2.821 | -2.628 |
| 2.984513020910212 | -2.948 | 2.838 | -2.659 |
| 2.990796206217391 | -2.957 | 2.856 | -2.69 |
| 2.997079391524571 | -2.966 | 2.873 | -2.72 |
| 3.003362576831751 | -2.975 | 2.889 | -2.749 |
| 3.009645762138931 | -2.983 | 2.905 | -2.777 |
| 3.01592894744611 | -2.992 | 2.921 | -2.804 |
| 3.02221213275329 | -3.001 | 2.936 | -2.83 |
| 3.028495318060469 | -3.009 | 2.951 | -2.856 |
| 3.034778503367649 | -3.017 | 2.966 | -2.88 |
| 3.041061688674829 | -3.026 | 2.98 | -2.904 |
| 3.047344873982008 | -3.034 | 2.993 | -2.926 |
| 3.053628059289188 | -3.042 | 3.006 | -2.948 |
| 3.059911244596367 | -3.05 | 3.019 | -2.969 |
| 3.066194429903547 | -3.057 | 3.031 | -2.988 |
| 3.072477615210727 | -3.065 | 3.043 | -3.007 |
| 3.078760800517906 | -3.073 | 3.054 | -3.024 |
| 3.085043985825086 | -3.08 | 3.065 | -3.041 |
| 3.091327171132266 | -3.087 | 3.076 | -3.056 |
| 3.097610356439445 | -3.095 | 3.086 | -3.071 |
| 3.103893541746625 | -3.102 | 3.095 | -3.084 |
| 3.110176727053805 | -3.109 | 3.104 | -3.096 |
| 3.116459912360984 | -3.115 | 3.113 | -3.108 |
| 3.122743097668164 | -3.122 | 3.121 | -3.118 |
| 3.129026282975343 | -3.129 | 3.128 | -3.127 |
| 3.135309468282523 | -3.135 | 3.135 | -3.135 |
| 3.141592653589703 | -3.142 | 3.142 | -3.142 |
| 3.147875838896883 | -3.148 | 3.148 | -3.147 |
| 3.154159024204062 | -3.154 | 3.153 | -3.152 |
| 3.160442209511242 | -3.16 | 3.158 | -3.155 |
| 3.166725394818422 | -3.166 | 3.163 | -3.158 |
| 3.173008580125601 | -3.171 | 3.167 | -3.159 |
| 3.179291765432781 | -3.177 | 3.17 | -3.159 |
| 3.18557495073996 | -3.182 | 3.173 | -3.158 |
| 3.19185813604714 | -3.188 | 3.176 | -3.156 |
| 3.19814132135432 | -3.193 | 3.178 | -3.152 |
| 3.2044245066615 | -3.198 | 3.179 | -3.148 |
| 3.210707691968679 | -3.203 | 3.18 | -3.142 |
| 3.216990877275859 | -3.208 | 3.18 | -3.135 |
| 3.223274062583038 | -3.213 | 3.18 | -3.127 |
| 3.229557247890217 | -3.217 | 3.18 | -3.118 |
| 3.235840433197398 | -3.221 | 3.179 | -3.107 |
| 3.242123618504577 | -3.226 | 3.177 | -3.096 |
| 3.248406803811757 | -3.23 | 3.175 | -3.083 |
| 3.254689989118936 | -3.234 | 3.172 | -3.069 |
| 3.260973174426116 | -3.238 | 3.168 | -3.054 |
| 3.267256359733296 | -3.241 | 3.165 | -3.038 |
| 3.273539545040475 | -3.245 | 3.16 | -3.02 |
| 3.279822730347655 | -3.249 | 3.155 | -3.002 |
| 3.286105915654835 | -3.252 | 3.15 | -2.982 |
| 3.292389100962014 | -3.255 | 3.144 | -2.961 |
| 3.298672286269194 | -3.258 | 3.137 | -2.939 |
| 3.304955471576374 | -3.261 | 3.13 | -2.916 |
| 3.311238656883553 | -3.264 | 3.122 | -2.892 |
| 3.317521842190732 | -3.266 | 3.114 | -2.866 |
| 3.323805027497912 | -3.269 | 3.106 | -2.839 |
| 3.330088212805092 | -3.271 | 3.096 | -2.812 |
| 3.336371398112272 | -3.273 | 3.086 | -2.783 |
| 3.342654583419451 | -3.275 | 3.076 | -2.753 |
| 3.34893776872663 | -3.277 | 3.065 | -2.722 |
| 3.355220954033811 | -3.279 | 3.054 | -2.689 |
| 3.36150413934099 | -3.281 | 3.042 | -2.656 |
| 3.36778732464817 | -3.282 | 3.029 | -2.622 |
| 3.37407050995535 | -3.283 | 3.016 | -2.586 |
| 3.380353695262529 | -3.284 | 3.002 | -2.55 |
| 3.386636880569709 | -3.285 | 2.988 | -2.512 |
| 3.392920065876888 | -3.286 | 2.973 | -2.473 |
| 3.399203251184068 | -3.287 | 2.958 | -2.434 |
| 3.405486436491248 | -3.288 | 2.942 | -2.393 |
| 3.411769621798427 | -3.288 | 2.926 | -2.351 |
| 3.418052807105607 | -3.288 | 2.909 | -2.308 |
| 3.424335992412787 | -3.288 | 2.891 | -2.265 |
| 3.430619177719966 | -3.288 | 2.873 | -2.22 |
| 3.436902363027146 | -3.288 | 2.855 | -2.174 |
| 3.443185548334325 | -3.288 | 2.836 | -2.127 |
| 3.449468733641505 | -3.287 | 2.816 | -2.08 |
| 3.455751918948685 | -3.287 | 2.796 | -2.031 |
| 3.462035104255865 | -3.286 | 2.775 | -1.982 |
| 3.468318289563044 | -3.285 | 2.754 | -1.931 |
| 3.474601474870224 | -3.284 | 2.732 | -1.88 |
| 3.480884660177403 | -3.282 | 2.71 | -1.828 |
| 3.487167845484583 | -3.281 | 2.687 | -1.775 |
| 3.493451030791763 | -3.279 | 2.664 | -1.721 |
| 3.499734216098942 | -3.278 | 2.64 | -1.667 |
| 3.506017401406122 | -3.276 | 2.615 | -1.611 |
| 3.512300586713302 | -3.274 | 2.59 | -1.555 |
| 3.518583772020481 | -3.271 | 2.565 | -1.498 |
| 3.524866957327661 | -3.269 | 2.539 | -1.44 |
| 3.531150142634841 | -3.267 | 2.513 | -1.382 |
| 3.53743332794202 | -3.264 | 2.486 | -1.323 |
| 3.5437165132492 | -3.261 | 2.458 | -1.263 |
| 3.54999969855638 | -3.258 | 2.43 | -1.203 |
| 3.556282883863559 | -3.255 | 2.402 | -1.141 |
| 3.562566069170739 | -3.252 | 2.373 | -1.08 |
| 3.568849254477918 | -3.248 | 2.343 | -1.017 |
| 3.575132439785098 | -3.244 | 2.313 | -0.954 |
| 3.581415625092278 | -3.241 | 2.283 | -0.891 |
| 3.587698810399457 | -3.237 | 2.252 | -0.827 |
| 3.593981995706637 | -3.232 | 2.221 | -0.762 |
| 3.600265181013817 | -3.228 | 2.189 | -0.697 |
| 3.606548366320996 | -3.224 | 2.156 | -0.631 |
| 3.612831551628176 | -3.219 | 2.124 | -0.565 |
| 3.619114736935355 | -3.214 | 2.09 | -0.499 |
| 3.625397922242535 | -3.209 | 2.057 | -0.432 |
| 3.631681107549715 | -3.204 | 2.022 | -0.364 |
| 3.637964292856894 | -3.199 | 1.988 | -0.297 |
| 3.644247478164074 | -3.193 | 1.953 | -0.229 |
| 3.650530663471254 | -3.188 | 1.917 | -0.161 |
| 3.656813848778433 | -3.182 | 1.881 | -0.092 |
| 3.663097034085613 | -3.176 | 1.845 | -0.023 |
| 3.669380219392792 | -3.17 | 1.808 | 0.046 |
| 3.675663404699972 | -3.164 | 1.771 | 0.115 |
| 3.681946590007152 | -3.157 | 1.733 | 0.185 |
| 3.688229775314331 | -3.151 | 1.695 | 0.255 |
| 3.694512960621511 | -3.144 | 1.657 | 0.325 |
| 3.700796145928691 | -3.137 | 1.618 | 0.395 |
| 3.70707933123587 | -3.13 | 1.578 | 0.465 |
| 3.71336251654305 | -3.123 | 1.539 | 0.535 |
| 3.71964570185023 | -3.115 | 1.499 | 0.605 |
| 3.72592888715741 | -3.108 | 1.458 | 0.675 |
| 3.732212072464589 | -3.1 | 1.417 | 0.745 |
| 3.738495257771769 | -3.092 | 1.376 | 0.816 |
| 3.744778443078948 | -3.084 | 1.335 | 0.886 |
| 3.751061628386128 | -3.076 | 1.293 | 0.956 |
| 3.757344813693308 | -3.067 | 1.251 | 1.026 |
| 3.763627999000487 | -3.059 | 1.208 | 1.095 |
| 3.769911184307667 | -3.05 | 1.165 | 1.165 |
| 3.776194369614846 | -3.041 | 1.122 | 1.234 |
| 3.782477554922026 | -3.032 | 1.078 | 1.304 |
| 3.788760740229206 | -3.023 | 1.034 | 1.373 |
| 3.795043925536385 | -3.013 | 0.99 | 1.441 |
| 3.801327110843565 | -3.004 | 0.945 | 1.51 |
| 3.807610296150745 | -2.994 | 0.9 | 1.578 |
| 3.813893481457924 | -2.984 | 0.855 | 1.646 |
| 3.820176666765104 | -2.974 | 0.81 | 1.713 |
| 3.826459852072284 | -2.964 | 0.764 | 1.78 |
| 3.832743037379463 | -2.953 | 0.718 | 1.846 |
| 3.839026222686643 | -2.943 | 0.672 | 1.913 |
| 3.845309407993823 | -2.932 | 0.625 | 1.978 |
| 3.851592593301002 | -2.921 | 0.579 | 2.043 |
| 3.857875778608182 | -2.91 | 0.532 | 2.108 |
| 3.864158963915361 | -2.899 | 0.484 | 2.172 |
| 3.870442149222541 | -2.887 | 0.437 | 2.235 |
| 3.876725334529721 | -2.876 | 0.389 | 2.298 |
| 3.8830085198369 | -2.864 | 0.341 | 2.361 |
| 3.88929170514408 | -2.852 | 0.293 | 2.422 |
| 3.89557489045126 | -2.84 | 0.245 | 2.483 |
| 3.901858075758439 | -2.827 | 0.196 | 2.543 |
| 3.908141261065619 | -2.815 | 0.147 | 2.603 |
| 3.914424446372799 | -2.802 | 0.098 | 2.662 |
| 3.920707631679978 | -2.79 | 0.049 | 2.72 |
| 3.926990816987158 | -2.777 | 0 | 2.777 |
| 3.933274002294337 | -2.764 | -0.049 | 2.833 |
| 3.939557187601517 | -2.75 | -0.099 | 2.889 |
| 3.945840372908697 | -2.737 | -0.149 | 2.943 |
| 3.952123558215876 | -2.723 | -0.199 | 2.997 |
| 3.958406743523056 | -2.71 | -0.249 | 3.05 |
| 3.964689928830236 | -2.696 | -0.299 | 3.102 |
| 3.970973114137415 | -2.682 | -0.349 | 3.153 |
| 3.977256299444595 | -2.667 | -0.399 | 3.203 |
| 3.983539484751775 | -2.653 | -0.45 | 3.252 |
| 3.989822670058954 | -2.639 | -0.5 | 3.3 |
| 3.996105855366134 | -2.624 | -0.551 | 3.347 |
| 4.002389040673314 | -2.609 | -0.601 | 3.393 |
| 4.008672225980493 | -2.594 | -0.652 | 3.438 |
| 4.014955411287672 | -2.579 | -0.703 | 3.481 |
| 4.021238596594851 | -2.563 | -0.754 | 3.524 |
| 4.02752178190203 | -2.548 | -0.804 | 3.565 |
| 4.03380496720921 | -2.532 | -0.855 | 3.606 |
| 4.040088152516389 | -2.516 | -0.906 | 3.645 |
| 4.046371337823567 | -2.5 | -0.957 | 3.683 |
| 4.052654523130747 | -2.484 | -1.008 | 3.719 |
| 4.058937708437926 | -2.468 | -1.059 | 3.755 |
| 4.065220893745105 | -2.451 | -1.11 | 3.789 |
| 4.071504079052285 | -2.434 | -1.16 | 3.822 |
| 4.077787264359464 | -2.418 | -1.211 | 3.854 |
| 4.084070449666643 | -2.401 | -1.262 | 3.884 |
| 4.090353634973822 | -2.383 | -1.313 | 3.913 |
| 4.096636820281001 | -2.366 | -1.363 | 3.941 |
| 4.102920005588181 | -2.349 | -1.414 | 3.968 |
| 4.10920319089536 | -2.331 | -1.465 | 3.993 |
| 4.115486376202539 | -2.313 | -1.515 | 4.016 |
| 4.121769561509718 | -2.295 | -1.565 | 4.039 |
| 4.128052746816897 | -2.277 | -1.616 | 4.06 |
| 4.134335932124077 | -2.259 | -1.666 | 4.079 |
| 4.140619117431256 | -2.241 | -1.716 | 4.097 |
| 4.146902302738435 | -2.222 | -1.766 | 4.114 |
| 4.153185488045614 | -2.203 | -1.815 | 4.13 |
| 4.159468673352793 | -2.184 | -1.865 | 4.143 |
| 4.165751858659973 | -2.165 | -1.914 | 4.156 |
| 4.172035043967152 | -2.146 | -1.964 | 4.167 |
| 4.178318229274331 | -2.127 | -2.013 | 4.176 |
| 4.18460141458151 | -2.107 | -2.062 | 4.184 |
| 4.190884599888689 | -2.088 | -2.111 | 4.191 |
| 4.197167785195868 | -2.068 | -2.159 | 4.196 |
| 4.203450970503048 | -2.048 | -2.208 | 4.199 |
| 4.209734155810227 | -2.028 | -2.256 | 4.201 |
| 4.216017341117406 | -2.008 | -2.304 | 4.202 |
| 4.222300526424585 | -1.987 | -2.351 | 4.201 |
| 4.228583711731764 | -1.967 | -2.399 | 4.198 |
| 4.234866897038944 | -1.946 | -2.446 | 4.194 |
| 4.241150082346122 | -1.925 | -2.493 | 4.189 |
| 4.247433267653302 | -1.904 | -2.54 | 4.182 |
| 4.253716452960481 | -1.883 | -2.586 | 4.173 |
| 4.25999963826766 | -1.862 | -2.632 | 4.163 |
| 4.26628282357484 | -1.841 | -2.678 | 4.152 |
| 4.272566008882019 | -1.819 | -2.723 | 4.138 |
| 4.278849194189198 | -1.797 | -2.769 | 4.124 |
| 4.285132379496377 | -1.776 | -2.814 | 4.107 |
| 4.291415564803557 | -1.754 | -2.858 | 4.09 |
| 4.297698750110735 | -1.732 | -2.902 | 4.07 |
| 4.303981935417915 | -1.709 | -2.946 | 4.05 |
| 4.310265120725094 | -1.687 | -2.99 | 4.027 |
| 4.316548306032273 | -1.664 | -3.033 | 4.003 |
| 4.322831491339452 | -1.642 | -3.076 | 3.978 |
| 4.329114676646632 | -1.619 | -3.118 | 3.951 |
| 4.335397861953811 | -1.596 | -3.16 | 3.923 |
| 4.34168104726099 | -1.573 | -3.202 | 3.893 |
| 4.347964232568169 | -1.55 | -3.243 | 3.862 |
| 4.354247417875348 | -1.526 | -3.284 | 3.829 |
| 4.360530603182528 | -1.503 | -3.325 | 3.794 |
| 4.366813788489707 | -1.479 | -3.365 | 3.759 |
| 4.373096973796886 | -1.455 | -3.404 | 3.721 |
| 4.379380159104065 | -1.432 | -3.443 | 3.683 |
| 4.385663344411244 | -1.408 | -3.482 | 3.643 |
| 4.391946529718424 | -1.383 | -3.52 | 3.601 |
| 4.398229715025602 | -1.359 | -3.558 | 3.558 |
| 4.404512900332782 | -1.335 | -3.596 | 3.514 |
| 4.41079608563996 | -1.31 | -3.632 | 3.468 |
| 4.41707927094714 | -1.286 | -3.669 | 3.421 |
| 4.42336245625432 | -1.261 | -3.705 | 3.373 |
| 4.429645641561499 | -1.236 | -3.74 | 3.323 |
| 4.435928826868678 | -1.211 | -3.775 | 3.272 |
| 4.442212012175857 | -1.186 | -3.809 | 3.219 |
| 4.448495197483036 | -1.16 | -3.843 | 3.165 |
| 4.454778382790215 | -1.135 | -3.876 | 3.11 |
| 4.461061568097395 | -1.109 | -3.909 | 3.054 |
| 4.467344753404574 | -1.084 | -3.941 | 2.996 |
| 4.473627938711753 | -1.058 | -3.973 | 2.937 |
| 4.479911124018932 | -1.032 | -4.004 | 2.877 |
| 4.486194309326112 | -1.006 | -4.035 | 2.816 |
| 4.49247749463329 | -0.98 | -4.065 | 2.753 |
| 4.49876067994047 | -0.954 | -4.094 | 2.69 |
| 4.50504386524765 | -0.927 | -4.123 | 2.625 |
| 4.511327050554828 | -0.901 | -4.151 | 2.559 |
| 4.517610235862008 | -0.874 | -4.179 | 2.492 |
| 4.523893421169186 | -0.848 | -4.206 | 2.424 |
| 4.530176606476366 | -0.821 | -4.233 | 2.355 |
| 4.536459791783545 | -0.794 | -4.259 | 2.285 |
| 4.542742977090724 | -0.767 | -4.284 | 2.213 |
| 4.549026162397904 | -0.74 | -4.308 | 2.141 |
| 4.555309347705083 | -0.713 | -4.332 | 2.068 |
| 4.561592533012262 | -0.685 | -4.356 | 1.994 |
| 4.567875718319441 | -0.658 | -4.378 | 1.919 |
| 4.57415890362662 | -0.63 | -4.4 | 1.843 |
| 4.5804420889338 | -0.603 | -4.422 | 1.766 |
| 4.586725274240979 | -0.575 | -4.443 | 1.688 |
| 4.593008459548158 | -0.547 | -4.463 | 1.61 |
| 4.599291644855337 | -0.519 | -4.482 | 1.531 |
| 4.605574830162516 | -0.491 | -4.501 | 1.451 |
| 4.611858015469695 | -0.463 | -4.519 | 1.37 |
| 4.618141200776875 | -0.435 | -4.536 | 1.288 |
| 4.624424386084054 | -0.406 | -4.553 | 1.206 |
| 4.630707571391233 | -0.378 | -4.569 | 1.123 |
| 4.636990756698412 | -0.349 | -4.584 | 1.04 |
| 4.643273942005591 | -0.321 | -4.599 | 0.956 |
| 4.649557127312771 | -0.292 | -4.613 | 0.871 |
| 4.65584031261995 | -0.263 | -4.626 | 0.786 |
| 4.66212349792713 | -0.234 | -4.639 | 0.7 |
| 4.668406683234308 | -0.205 | -4.65 | 0.614 |
| 4.674689868541487 | -0.176 | -4.661 | 0.528 |
| 4.680973053848666 | -0.147 | -4.672 | 0.441 |
| 4.687256239155846 | -0.118 | -4.681 | 0.353 |
| 4.693539424463024 | -0.088 | -4.69 | 0.265 |
| 4.699822609770204 | -0.059 | -4.698 | 0.177 |
| 4.706105795077383 | -0.03 | -4.706 | 0.089 |
| 4.712388980384562 | 0 | -4.712 | 0 |
| 4.718672165691741 | 0.03 | -4.718 | -0.089 |
| 4.724955350998921 | 0.059 | -4.723 | -0.178 |
| 4.7312385363061 | 0.089 | -4.728 | -0.267 |
| 4.73752172161328 | 0.119 | -4.732 | -0.357 |
| 4.743804906920459 | 0.149 | -4.734 | -0.446 |
| 4.750088092227637 | 0.179 | -4.737 | -0.536 |
| 4.756371277534817 | 0.209 | -4.738 | -0.626 |
| 4.762654462841996 | 0.239 | -4.739 | -0.715 |
| 4.768937648149175 | 0.27 | -4.738 | -0.805 |
| 4.775220833456354 | 0.3 | -4.738 | -0.895 |
| 4.781504018763534 | 0.33 | -4.736 | -0.984 |
| 4.787787204070713 | 0.361 | -4.733 | -1.074 |
| 4.794070389377892 | 0.391 | -4.73 | -1.163 |
| 4.800353574685071 | 0.422 | -4.726 | -1.252 |
| 4.806636759992251 | 0.452 | -4.721 | -1.341 |
| 4.81291994529943 | 0.483 | -4.716 | -1.43 |
| 4.819203130606608 | 0.514 | -4.71 | -1.518 |
| 4.825486315913788 | 0.545 | -4.703 | -1.606 |
| 4.831769501220967 | 0.575 | -4.695 | -1.694 |
| 4.838052686528146 | 0.606 | -4.686 | -1.781 |
| 4.844335871835326 | 0.637 | -4.677 | -1.868 |
| 4.850619057142505 | 0.668 | -4.666 | -1.954 |
| 4.856902242449684 | 0.699 | -4.655 | -2.04 |
| 4.863185427756863 | 0.731 | -4.644 | -2.126 |
| 4.869468613064042 | 0.762 | -4.631 | -2.211 |
| 4.875751798371221 | 0.793 | -4.618 | -2.295 |
| 4.882034983678401 | 0.824 | -4.604 | -2.379 |
| 4.88831816898558 | 0.856 | -4.589 | -2.462 |
| 4.894601354292759 | 0.887 | -4.573 | -2.544 |
| 4.900884539599939 | 0.918 | -4.557 | -2.626 |
| 4.907167724907117 | 0.95 | -4.54 | -2.707 |
| 4.913450910214297 | 0.981 | -4.522 | -2.787 |
| 4.919734095521476 | 1.013 | -4.503 | -2.867 |
| 4.926017280828655 | 1.044 | -4.483 | -2.945 |
| 4.932300466135834 | 1.076 | -4.463 | -3.023 |
| 4.938583651443014 | 1.108 | -4.442 | -3.1 |
| 4.944866836750193 | 1.139 | -4.42 | -3.176 |
| 4.951150022057372 | 1.171 | -4.397 | -3.251 |
| 4.957433207364551 | 1.203 | -4.374 | -3.325 |
| 4.96371639267173 | 1.234 | -4.35 | -3.398 |
| 4.96999957797891 | 1.266 | -4.325 | -3.47 |
| 4.976282763286088 | 1.298 | -4.299 | -3.541 |
| 4.982565948593268 | 1.33 | -4.273 | -3.611 |
| 4.988849133900447 | 1.362 | -4.245 | -3.679 |
| 4.995132319207626 | 1.394 | -4.218 | -3.747 |
| 5.001415504514805 | 1.425 | -4.189 | -3.813 |
| 5.007698689821984 | 1.457 | -4.159 | -3.878 |
| 5.013981875129164 | 1.489 | -4.129 | -3.942 |
| 5.020265060436343 | 1.521 | -4.098 | -4.005 |
| 5.026548245743522 | 1.553 | -4.067 | -4.067 |
| 5.032831431050702 | 1.585 | -4.034 | -4.127 |
| 5.039114616357881 | 1.617 | -4.001 | -4.185 |
| 5.04539780166506 | 1.649 | -3.967 | -4.243 |
| 5.05168098697224 | 1.681 | -3.933 | -4.299 |
| 5.057964172279418 | 1.713 | -3.897 | -4.354 |
| 5.064247357586598 | 1.745 | -3.861 | -4.407 |
| 5.070530542893777 | 1.777 | -3.824 | -4.459 |
| 5.076813728200956 | 1.809 | -3.787 | -4.509 |
| 5.083096913508135 | 1.841 | -3.749 | -4.558 |
| 5.089380098815314 | 1.874 | -3.71 | -4.605 |
| 5.095663284122493 | 1.906 | -3.67 | -4.651 |
| 5.101946469429673 | 1.938 | -3.63 | -4.695 |
| 5.108229654736852 | 1.97 | -3.589 | -4.738 |
| 5.114512840044031 | 2.002 | -3.548 | -4.779 |
| 5.12079602535121 | 2.034 | -3.505 | -4.818 |
| 5.12707921065839 | 2.066 | -3.462 | -4.856 |
| 5.133362395965568 | 2.098 | -3.419 | -4.892 |
| 5.139645581272747 | 2.13 | -3.375 | -4.926 |
| 5.145928766579927 | 2.162 | -3.33 | -4.959 |
| 5.152211951887106 | 2.194 | -3.284 | -4.99 |
| 5.158495137194286 | 2.226 | -3.238 | -5.02 |
| 5.164778322501465 | 2.258 | -3.191 | -5.047 |
| 5.171061507808644 | 2.29 | -3.144 | -5.073 |
| 5.177344693115823 | 2.321 | -3.096 | -5.097 |
| 5.183627878423002 | 2.353 | -3.047 | -5.12 |
| 5.189911063730181 | 2.385 | -2.998 | -5.14 |
| 5.196194249037361 | 2.417 | -2.948 | -5.159 |
| 5.20247743434454 | 2.449 | -2.897 | -5.176 |
| 5.20876061965172 | 2.481 | -2.846 | -5.191 |
| 5.215043804958898 | 2.512 | -2.794 | -5.205 |
| 5.221326990266077 | 2.544 | -2.742 | -5.216 |
| 5.227610175573257 | 2.576 | -2.689 | -5.226 |
| 5.233893360880435 | 2.607 | -2.636 | -5.234 |
| 5.240176546187615 | 2.639 | -2.582 | -5.24 |
| 5.246459731494794 | 2.671 | -2.528 | -5.244 |
| 5.252742916801973 | 2.702 | -2.472 | -5.246 |
| 5.259026102109152 | 2.734 | -2.417 | -5.246 |
| 5.265309287416332 | 2.765 | -2.361 | -5.245 |
| 5.27159247272351 | 2.797 | -2.304 | -5.242 |
| 5.27787565803069 | 2.828 | -2.247 | -5.236 |
| 5.284158843337869 | 2.859 | -2.19 | -5.229 |
| 5.290442028645049 | 2.891 | -2.132 | -5.22 |
| 5.296725213952227 | 2.922 | -2.073 | -5.209 |
| 5.303008399259407 | 2.953 | -2.014 | -5.196 |
| 5.309291584566586 | 2.984 | -1.954 | -5.181 |
| 5.315574769873765 | 3.015 | -1.895 | -5.165 |
| 5.321857955180945 | 3.046 | -1.834 | -5.146 |
| 5.328141140488124 | 3.077 | -1.773 | -5.126 |
| 5.334424325795303 | 3.108 | -1.712 | -5.104 |
| 5.340707511102482 | 3.139 | -1.65 | -5.079 |
| 5.346990696409661 | 3.17 | -1.588 | -5.053 |
| 5.35327388171684 | 3.201 | -1.526 | -5.025 |
| 5.35955706702402 | 3.231 | -1.463 | -4.995 |
| 5.365840252331199 | 3.262 | -1.4 | -4.964 |
| 5.372123437638378 | 3.293 | -1.336 | -4.93 |
| 5.378406622945557 | 3.323 | -1.272 | -4.895 |
| 5.384689808252737 | 3.354 | -1.208 | -4.858 |
| 5.390972993559916 | 3.384 | -1.143 | -4.819 |
| 5.397256178867095 | 3.414 | -1.078 | -4.778 |
| 5.403539364174274 | 3.444 | -1.013 | -4.735 |
| 5.409822549481453 | 3.474 | -0.947 | -4.691 |
| 5.416105734788632 | 3.505 | -0.881 | -4.644 |
| 5.422388920095812 | 3.534 | -0.815 | -4.596 |
| 5.42867210540299 | 3.564 | -0.748 | -4.547 |
| 5.43495529071017 | 3.594 | -0.681 | -4.495 |
| 5.44123847601735 | 3.624 | -0.614 | -4.442 |
| 5.447521661324528 | 3.654 | -0.547 | -4.387 |
| 5.453804846631708 | 3.683 | -0.479 | -4.33 |
| 5.460088031938887 | 3.713 | -0.411 | -4.272 |
| 5.466371217246066 | 3.742 | -0.343 | -4.212 |
| 5.472654402553245 | 3.771 | -0.275 | -4.15 |
| 5.478937587860424 | 3.8 | -0.207 | -4.087 |
| 5.485220773167603 | 3.83 | -0.138 | -4.022 |
| 5.491503958474783 | 3.859 | -0.069 | -3.956 |
| 5.497787143781962 | 3.888 | 0 | -3.888 |
| 5.504070329089141 | 3.916 | 0.069 | -3.818 |
| 5.51035351439632 | 3.945 | 0.138 | -3.747 |
| 5.5166366997035 | 3.974 | 0.208 | -3.674 |
| 5.522919885010679 | 4.002 | 0.277 | -3.6 |
| 5.529203070317858 | 4.031 | 0.347 | -3.524 |
| 5.535486255625037 | 4.059 | 0.417 | -3.447 |
| 5.541769440932216 | 4.087 | 0.487 | -3.369 |
| 5.548052626239396 | 4.115 | 0.557 | -3.289 |
| 5.554335811546575 | 4.143 | 0.627 | -3.208 |
| 5.560618996853754 | 4.171 | 0.697 | -3.126 |
| 5.566902182160933 | 4.199 | 0.767 | -3.042 |
| 5.573185367468112 | 4.226 | 0.837 | -2.957 |
| 5.579468552775292 | 4.254 | 0.907 | -2.87 |
| 5.585751738082471 | 4.281 | 0.978 | -2.783 |
| 5.59203492338965 | 4.309 | 1.048 | -2.694 |
| 5.59831810869683 | 4.336 | 1.118 | -2.604 |
| 5.604601294004008 | 4.363 | 1.188 | -2.513 |
| 5.610884479311188 | 4.39 | 1.258 | -2.421 |
| 5.617167664618367 | 4.417 | 1.328 | -2.328 |
| 5.623450849925546 | 4.443 | 1.398 | -2.233 |
| 5.629734035232725 | 4.47 | 1.468 | -2.138 |
| 5.636017220539904 | 4.496 | 1.538 | -2.042 |
| 5.642300405847083 | 4.523 | 1.608 | -1.945 |
| 5.648583591154263 | 4.549 | 1.678 | -1.846 |
| 5.654866776461442 | 4.575 | 1.747 | -1.747 |
| 5.661149961768621 | 4.601 | 1.817 | -1.648 |
| 5.6674331470758 | 4.627 | 1.886 | -1.547 |
| 5.673716332382979 | 4.652 | 1.955 | -1.445 |
| 5.679999517690159 | 4.678 | 2.024 | -1.343 |
| 5.686282702997337 | 4.703 | 2.093 | -1.24 |
| 5.692565888304517 | 4.728 | 2.162 | -1.137 |
| 5.698849073611696 | 4.753 | 2.23 | -1.033 |
| 5.705132258918875 | 4.778 | 2.299 | -0.928 |
| 5.711415444226055 | 4.803 | 2.367 | -0.823 |
| 5.717698629533234 | 4.828 | 2.434 | -0.717 |
| 5.723981814840413 | 4.852 | 2.502 | -0.61 |
| 5.730265000147592 | 4.876 | 2.569 | -0.503 |
| 5.73654818545477 | 4.901 | 2.636 | -0.396 |
| 5.742831370761951 | 4.925 | 2.703 | -0.289 |
| 5.74911455606913 | 4.949 | 2.77 | -0.181 |
| 5.75539774137631 | 4.972 | 2.836 | -0.072 |
| 5.761680926683488 | 4.996 | 2.902 | 0.036 |
| 5.767964111990667 | 5.019 | 2.967 | 0.145 |
| 5.774247297297846 | 5.042 | 3.032 | 0.254 |
| 5.780530482605025 | 5.066 | 3.097 | 0.363 |
| 5.786813667912205 | 5.088 | 3.162 | 0.472 |
| 5.793096853219384 | 5.111 | 3.226 | 0.581 |
| 5.799380038526563 | 5.134 | 3.29 | 0.691 |
| 5.805663223833742 | 5.156 | 3.353 | 0.8 |
| 5.811946409140922 | 5.178 | 3.416 | 0.909 |
| 5.8182295944481 | 5.201 | 3.479 | 1.018 |
| 5.82451277975528 | 5.222 | 3.541 | 1.127 |
| 5.830795965062459 | 5.244 | 3.603 | 1.236 |
| 5.837079150369638 | 5.266 | 3.664 | 1.345 |
| 5.843362335676817 | 5.287 | 3.725 | 1.453 |
| 5.849645520983997 | 5.308 | 3.785 | 1.561 |
| 5.855928706291176 | 5.33 | 3.845 | 1.669 |
| 5.862211891598355 | 5.35 | 3.904 | 1.776 |
| 5.868495076905535 | 5.371 | 3.963 | 1.883 |
| 5.874778262212714 | 5.392 | 4.022 | 1.99 |
| 5.881061447519893 | 5.412 | 4.079 | 2.096 |
| 5.887344632827072 | 5.432 | 4.137 | 2.202 |
| 5.893627818134251 | 5.452 | 4.194 | 2.307 |
| 5.899911003441431 | 5.472 | 4.25 | 2.411 |
| 5.90619418874861 | 5.491 | 4.305 | 2.515 |
| 5.912477374055789 | 5.511 | 4.361 | 2.618 |
| 5.918760559362968 | 5.53 | 4.415 | 2.72 |
| 5.925043744670147 | 5.549 | 4.469 | 2.822 |
| 5.931326929977326 | 5.568 | 4.522 | 2.923 |
| 5.937610115284505 | 5.587 | 4.575 | 3.022 |
| 5.943893300591684 | 5.605 | 4.627 | 3.122 |
| 5.950176485898864 | 5.623 | 4.679 | 3.22 |
| 5.956459671206043 | 5.641 | 4.729 | 3.317 |
| 5.962742856513223 | 5.659 | 4.78 | 3.413 |
| 5.969026041820402 | 5.677 | 4.829 | 3.509 |
| 5.975309227127581 | 5.694 | 4.878 | 3.603 |
| 5.98159241243476 | 5.712 | 4.926 | 3.696 |
| 5.987875597741939 | 5.729 | 4.974 | 3.788 |
| 5.994158783049118 | 5.746 | 5.02 | 3.879 |
| 6.000441968356298 | 5.762 | 5.066 | 3.968 |
| 6.006725153663476 | 5.779 | 5.112 | 4.057 |
| 6.013008338970656 | 5.795 | 5.156 | 4.144 |
| 6.019291524277835 | 5.811 | 5.2 | 4.229 |
| 6.025574709585015 | 5.827 | 5.243 | 4.314 |
| 6.031857894892193 | 5.842 | 5.286 | 4.397 |
| 6.038141080199372 | 5.858 | 5.327 | 4.479 |
| 6.044424265506552 | 5.873 | 5.368 | 4.559 |
| 6.050707450813731 | 5.888 | 5.408 | 4.638 |
| 6.05699063612091 | 5.903 | 5.448 | 4.715 |
| 6.06327382142809 | 5.917 | 5.486 | 4.791 |
| 6.069557006735269 | 5.932 | 5.524 | 4.865 |
| 6.075840192042448 | 5.946 | 5.561 | 4.938 |
| 6.082123377349627 | 5.96 | 5.597 | 5.009 |
| 6.088406562656806 | 5.973 | 5.632 | 5.078 |
| 6.094689747963986 | 5.987 | 5.667 | 5.146 |
| 6.100972933271164 | 6 | 5.7 | 5.212 |
| 6.107256118578344 | 6.013 | 5.733 | 5.276 |
| 6.113539303885523 | 6.026 | 5.765 | 5.339 |
| 6.119822489192702 | 6.038 | 5.796 | 5.399 |
| 6.126105674499882 | 6.051 | 5.826 | 5.458 |
| 6.132388859807061 | 6.063 | 5.856 | 5.516 |
| 6.13867204511424 | 6.075 | 5.884 | 5.571 |
| 6.144955230421419 | 6.086 | 5.912 | 5.624 |
| 6.151238415728598 | 6.098 | 5.938 | 5.676 |
| 6.157521601035778 | 6.109 | 5.964 | 5.725 |
| 6.163804786342957 | 6.12 | 5.989 | 5.773 |
| 6.170087971650136 | 6.131 | 6.013 | 5.818 |
| 6.176371156957315 | 6.141 | 6.036 | 5.862 |
| 6.182654342264494 | 6.151 | 6.058 | 5.904 |
| 6.188937527571674 | 6.161 | 6.079 | 5.943 |
| 6.195220712878853 | 6.171 | 6.1 | 5.981 |
| 6.201503898186032 | 6.181 | 6.119 | 6.016 |
| 6.207787083493211 | 6.19 | 6.137 | 6.05 |
| 6.21407026880039 | 6.199 | 6.155 | 6.081 |
| 6.22035345410757 | 6.208 | 6.171 | 6.11 |
| 6.226636639414749 | 6.217 | 6.187 | 6.137 |
| 6.232919824721928 | 6.225 | 6.201 | 6.162 |
| 6.239203010029107 | 6.233 | 6.215 | 6.185 |
| 6.245486195336286 | 6.241 | 6.228 | 6.206 |
| 6.251769380643465 | 6.249 | 6.239 | 6.224 |
| 6.258052565950644 | 6.256 | 6.25 | 6.24 |
| 6.264335751257824 | 6.263 | 6.26 | 6.254 |
| 6.270618936565003 | 6.27 | 6.269 | 6.266 |
| 6.276902121872182 | 6.277 | 6.276 | 6.276 |
| 6.283185307179361 | 6.283 | 6.283 | 6.283 |